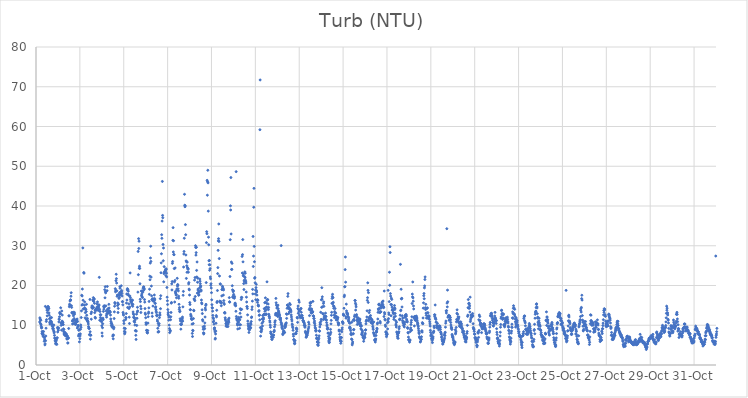
| Category | Turb (NTU) |
|---|---|
| 44470.166666666664 | 10.82 |
| 44470.177083333336 | 11.87 |
| 44470.1875 | 11.6 |
| 44470.197916666664 | 11.34 |
| 44470.208333333336 | 10.41 |
| 44470.21875 | 11.25 |
| 44470.229166666664 | 10.13 |
| 44470.239583333336 | 9.72 |
| 44470.25 | 9.32 |
| 44470.260416666664 | 9.4 |
| 44470.270833333336 | 7.91 |
| 44470.28125 | 8.44 |
| 44470.291666666664 | 8.26 |
| 44470.302083333336 | 7.78 |
| 44470.3125 | 7.31 |
| 44470.322916666664 | 7.8 |
| 44470.333333333336 | 7.64 |
| 44470.34375 | 8.42 |
| 44470.354166666664 | 7.11 |
| 44470.364583333336 | 7.03 |
| 44470.375 | 5.97 |
| 44470.385416666664 | 6.92 |
| 44470.395833333336 | 6.49 |
| 44470.40625 | 5.06 |
| 44470.416666666664 | 5.33 |
| 44470.427083333336 | 14.74 |
| 44470.4375 | 6.1 |
| 44470.447916666664 | 7.29 |
| 44470.458333333336 | 9.26 |
| 44470.46875 | 10.96 |
| 44470.479166666664 | 11.41 |
| 44470.489583333336 | 14.35 |
| 44470.5 | 13.8 |
| 44470.510416666664 | 12.36 |
| 44470.520833333336 | 13.19 |
| 44470.53125 | 14.47 |
| 44470.541666666664 | 14.7 |
| 44470.552083333336 | 13.8 |
| 44470.5625 | 14.67 |
| 44470.572916666664 | 14.28 |
| 44470.583333333336 | 14.2 |
| 44470.59375 | 13.1 |
| 44470.604166666664 | 12.51 |
| 44470.614583333336 | 11.63 |
| 44470.625 | 10.66 |
| 44470.635416666664 | 10.29 |
| 44470.645833333336 | 10.95 |
| 44470.65625 | 11.85 |
| 44470.666666666664 | 11.84 |
| 44470.677083333336 | 11.02 |
| 44470.6875 | 11.02 |
| 44470.697916666664 | 10.88 |
| 44470.708333333336 | 11.93 |
| 44470.71875 | 10.54 |
| 44470.729166666664 | 9.84 |
| 44470.739583333336 | 10.07 |
| 44470.75 | 10 |
| 44470.760416666664 | 9.24 |
| 44470.770833333336 | 9.63 |
| 44470.78125 | 8.99 |
| 44470.791666666664 | 9.18 |
| 44470.802083333336 | 8.58 |
| 44470.8125 | 10.06 |
| 44470.822916666664 | 8.08 |
| 44470.833333333336 | 8.33 |
| 44470.84375 | 7.45 |
| 44470.854166666664 | 6.8 |
| 44470.864583333336 | 6.72 |
| 44470.875 | 6.19 |
| 44470.885416666664 | 5.91 |
| 44470.895833333336 | 5.3 |
| 44470.90625 | 5.5 |
| 44470.916666666664 | 5.4 |
| 44470.927083333336 | 6.09 |
| 44470.9375 | 6.54 |
| 44470.947916666664 | 5.18 |
| 44470.958333333336 | 6.84 |
| 44470.96875 | 6.82 |
| 44470.979166666664 | 9.44 |
| 44470.989583333336 | 8.32 |
| 44471.0 | 9.1 |
| 44471.010416666664 | 9.16 |
| 44471.020833333336 | 8.75 |
| 44471.03125 | 9.36 |
| 44471.041666666664 | 10.84 |
| 44471.052083333336 | 11.56 |
| 44471.0625 | 11.46 |
| 44471.072916666664 | 12.13 |
| 44471.083333333336 | 13.23 |
| 44471.09375 | 12.94 |
| 44471.104166666664 | 12.97 |
| 44471.114583333336 | 12.9 |
| 44471.125 | 14.39 |
| 44471.135416666664 | 10.58 |
| 44471.145833333336 | 9.98 |
| 44471.15625 | 10.6 |
| 44471.166666666664 | 8.78 |
| 44471.177083333336 | 13.58 |
| 44471.1875 | 11.04 |
| 44471.197916666664 | 12.56 |
| 44471.208333333336 | 10.91 |
| 44471.21875 | 10.21 |
| 44471.229166666664 | 10.65 |
| 44471.239583333336 | 10.18 |
| 44471.25 | 9.11 |
| 44471.260416666664 | 8.39 |
| 44471.270833333336 | 8.91 |
| 44471.28125 | 7.78 |
| 44471.291666666664 | 7.94 |
| 44471.302083333336 | 7.55 |
| 44471.3125 | 7.78 |
| 44471.322916666664 | 8.18 |
| 44471.333333333336 | 7.99 |
| 44471.34375 | 7.42 |
| 44471.354166666664 | 7.4 |
| 44471.364583333336 | 7.66 |
| 44471.375 | 7.23 |
| 44471.385416666664 | 7.81 |
| 44471.395833333336 | 7.36 |
| 44471.40625 | 6.56 |
| 44471.416666666664 | 6.58 |
| 44471.427083333336 | 7.37 |
| 44471.4375 | 6.61 |
| 44471.447916666664 | 5.54 |
| 44471.458333333336 | 5.54 |
| 44471.46875 | 6.93 |
| 44471.479166666664 | 6.75 |
| 44471.489583333336 | 9.19 |
| 44471.5 | 12.39 |
| 44471.510416666664 | 12.34 |
| 44471.520833333336 | 14.66 |
| 44471.53125 | 15.29 |
| 44471.541666666664 | 15 |
| 44471.552083333336 | 16.1 |
| 44471.5625 | 16.31 |
| 44471.572916666664 | 16.34 |
| 44471.583333333336 | 16.35 |
| 44471.59375 | 17.3 |
| 44471.604166666664 | 18.18 |
| 44471.614583333336 | 14.93 |
| 44471.625 | 14.49 |
| 44471.635416666664 | 13.22 |
| 44471.645833333336 | 13.04 |
| 44471.65625 | 11.05 |
| 44471.666666666664 | 10.32 |
| 44471.677083333336 | 11.3 |
| 44471.6875 | 12.94 |
| 44471.697916666664 | 13.27 |
| 44471.708333333336 | 12.36 |
| 44471.71875 | 11.2 |
| 44471.729166666664 | 10.47 |
| 44471.739583333336 | 11.68 |
| 44471.75 | 13.23 |
| 44471.760416666664 | 12.82 |
| 44471.770833333336 | 10.49 |
| 44471.78125 | 11.2 |
| 44471.791666666664 | 10.22 |
| 44471.802083333336 | 10.23 |
| 44471.8125 | 10.3 |
| 44471.822916666664 | 10.93 |
| 44471.833333333336 | 11.26 |
| 44471.84375 | 11.37 |
| 44471.854166666664 | 10.8 |
| 44471.864583333336 | 10.98 |
| 44471.875 | 11.56 |
| 44471.885416666664 | 9.3 |
| 44471.895833333336 | 10.96 |
| 44471.90625 | 9.69 |
| 44471.916666666664 | 9.97 |
| 44471.927083333336 | 9.83 |
| 44471.9375 | 7.31 |
| 44471.947916666664 | 8.72 |
| 44471.958333333336 | 7.72 |
| 44471.96875 | 8.88 |
| 44471.979166666664 | 5.82 |
| 44471.989583333336 | 7.68 |
| 44472.0 | 6.63 |
| 44472.010416666664 | 7.32 |
| 44472.020833333336 | 7.83 |
| 44472.03125 | 8.99 |
| 44472.041666666664 | 10.06 |
| 44472.052083333336 | 9.5 |
| 44472.0625 | 11.94 |
| 44472.072916666664 | 13.62 |
| 44472.083333333336 | 17.54 |
| 44472.09375 | 15.07 |
| 44472.104166666664 | 17.37 |
| 44472.114583333336 | 19.11 |
| 44472.125 | 15.24 |
| 44472.135416666664 | 29.45 |
| 44472.145833333336 | 16.3 |
| 44472.15625 | 14.13 |
| 44472.166666666664 | 359.94 |
| 44472.177083333336 | 23.27 |
| 44472.1875 | 23.09 |
| 44472.197916666664 | 14.13 |
| 44472.208333333336 | 15.04 |
| 44472.21875 | 15.88 |
| 44472.229166666664 | 14.35 |
| 44472.239583333336 | 11.88 |
| 44472.25 | 13.17 |
| 44472.260416666664 | 13.97 |
| 44472.270833333336 | 14.01 |
| 44472.28125 | 11.56 |
| 44472.291666666664 | 13.44 |
| 44472.302083333336 | 15.26 |
| 44472.3125 | 12.51 |
| 44472.322916666664 | 11.46 |
| 44472.333333333336 | 11.23 |
| 44472.34375 | 11.72 |
| 44472.354166666664 | 11.02 |
| 44472.364583333336 | 10.98 |
| 44472.375 | 10.78 |
| 44472.385416666664 | 10.32 |
| 44472.395833333336 | 9.66 |
| 44472.40625 | 9.3 |
| 44472.416666666664 | 9.26 |
| 44472.427083333336 | 9.19 |
| 44472.4375 | 7.66 |
| 44472.447916666664 | 7.56 |
| 44472.458333333336 | 16.49 |
| 44472.46875 | 8.36 |
| 44472.479166666664 | 6.5 |
| 44472.489583333336 | 7.54 |
| 44472.5 | 7.48 |
| 44472.510416666664 | 12.92 |
| 44472.520833333336 | 11.52 |
| 44472.53125 | 13.34 |
| 44472.541666666664 | 14.54 |
| 44472.552083333336 | 14.86 |
| 44472.5625 | 14.26 |
| 44472.572916666664 | 14.79 |
| 44472.583333333336 | 14.3 |
| 44472.59375 | 16.38 |
| 44472.604166666664 | 16.19 |
| 44472.614583333336 | 16.95 |
| 44472.625 | 14.47 |
| 44472.635416666664 | 15.98 |
| 44472.645833333336 | 16.54 |
| 44472.65625 | 16.63 |
| 44472.666666666664 | 15.51 |
| 44472.677083333336 | 13.17 |
| 44472.6875 | 13.84 |
| 44472.697916666664 | 12 |
| 44472.708333333336 | 11.79 |
| 44472.71875 | 13.69 |
| 44472.729166666664 | 14 |
| 44472.739583333336 | 13.88 |
| 44472.75 | 13.92 |
| 44472.760416666664 | 14.3 |
| 44472.770833333336 | 14.12 |
| 44472.78125 | 15.36 |
| 44472.791666666664 | 14.64 |
| 44472.802083333336 | 15.87 |
| 44472.8125 | 14.5 |
| 44472.822916666664 | 14.27 |
| 44472.833333333336 | 13.74 |
| 44472.84375 | 14.73 |
| 44472.854166666664 | 14.53 |
| 44472.864583333336 | 15.14 |
| 44472.875 | 15.05 |
| 44472.885416666664 | 22.05 |
| 44472.895833333336 | 14.02 |
| 44472.90625 | 11.25 |
| 44472.916666666664 | 13.46 |
| 44472.927083333336 | 12.64 |
| 44472.9375 | 11.96 |
| 44472.947916666664 | 11.2 |
| 44472.958333333336 | 12.63 |
| 44472.96875 | 11.59 |
| 44472.979166666664 | 11.04 |
| 44472.989583333336 | 10.89 |
| 44473.0 | 9.86 |
| 44473.010416666664 | 8.06 |
| 44473.020833333336 | 7.28 |
| 44473.03125 | 9.38 |
| 44473.041666666664 | 10.39 |
| 44473.052083333336 | 11.78 |
| 44473.0625 | 11.41 |
| 44473.072916666664 | 13.48 |
| 44473.083333333336 | 14.69 |
| 44473.09375 | 14.05 |
| 44473.104166666664 | 14.89 |
| 44473.114583333336 | 14.54 |
| 44473.125 | 14.83 |
| 44473.135416666664 | 18.94 |
| 44473.145833333336 | 16.9 |
| 44473.15625 | 19.7 |
| 44473.166666666664 | 18.41 |
| 44473.177083333336 | 18.15 |
| 44473.1875 | 14.88 |
| 44473.197916666664 | 13.6 |
| 44473.208333333336 | 12.51 |
| 44473.21875 | 12.05 |
| 44473.229166666664 | 12.93 |
| 44473.239583333336 | 18.7 |
| 44473.25 | 19.76 |
| 44473.260416666664 | 14.02 |
| 44473.270833333336 | 12.95 |
| 44473.28125 | 13.22 |
| 44473.291666666664 | 13.56 |
| 44473.302083333336 | 14.21 |
| 44473.3125 | 13.23 |
| 44473.322916666664 | 15.27 |
| 44473.333333333336 | 14.33 |
| 44473.34375 | 13.16 |
| 44473.354166666664 | 13.6 |
| 44473.364583333336 | 13.4 |
| 44473.375 | 13.36 |
| 44473.385416666664 | 13.28 |
| 44473.395833333336 | 12.57 |
| 44473.40625 | 11.58 |
| 44473.416666666664 | 10.96 |
| 44473.427083333336 | 10.47 |
| 44473.4375 | 9.91 |
| 44473.447916666664 | 10.5 |
| 44473.458333333336 | 9.86 |
| 44473.46875 | 10.13 |
| 44473.479166666664 | 9.46 |
| 44473.489583333336 | 9.73 |
| 44473.5 | 7.26 |
| 44473.510416666664 | 7.54 |
| 44473.520833333336 | 6.58 |
| 44473.53125 | 7.52 |
| 44473.541666666664 | 9.12 |
| 44473.552083333336 | 9.48 |
| 44473.5625 | 11.69 |
| 44473.572916666664 | 13.37 |
| 44473.583333333336 | 14.79 |
| 44473.59375 | 15.71 |
| 44473.604166666664 | 15.45 |
| 44473.614583333336 | 19.2 |
| 44473.625 | 18.41 |
| 44473.635416666664 | 18.81 |
| 44473.645833333336 | 21.21 |
| 44473.65625 | 22.83 |
| 44473.666666666664 | 21.73 |
| 44473.677083333336 | 20.62 |
| 44473.6875 | 18.64 |
| 44473.697916666664 | 17.27 |
| 44473.708333333336 | 17.6 |
| 44473.71875 | 14.95 |
| 44473.729166666664 | 15.61 |
| 44473.739583333336 | 13.21 |
| 44473.75 | 14.24 |
| 44473.760416666664 | 15.28 |
| 44473.770833333336 | 17.74 |
| 44473.78125 | 16.75 |
| 44473.791666666664 | 17.51 |
| 44473.802083333336 | 17.03 |
| 44473.8125 | 18.22 |
| 44473.822916666664 | 19.67 |
| 44473.833333333336 | 19.3 |
| 44473.84375 | 18.2 |
| 44473.854166666664 | 17.64 |
| 44473.864583333336 | 17.7 |
| 44473.875 | 18.4 |
| 44473.885416666664 | 19.93 |
| 44473.895833333336 | 18.46 |
| 44473.90625 | 18.73 |
| 44473.916666666664 | 18.01 |
| 44473.927083333336 | 17.36 |
| 44473.9375 | 15.93 |
| 44473.947916666664 | 15.95 |
| 44473.958333333336 | 15.13 |
| 44473.96875 | 13.22 |
| 44473.979166666664 | 12.83 |
| 44473.989583333336 | 12.55 |
| 44474.0 | 11.11 |
| 44474.010416666664 | 10.45 |
| 44474.020833333336 | 9.25 |
| 44474.03125 | 8.46 |
| 44474.041666666664 | 7.85 |
| 44474.052083333336 | 8.07 |
| 44474.0625 | 8.31 |
| 44474.072916666664 | 9.17 |
| 44474.083333333336 | 11.42 |
| 44474.09375 | 11.97 |
| 44474.104166666664 | 11.84 |
| 44474.114583333336 | 12.94 |
| 44474.125 | 15.58 |
| 44474.135416666664 | 17.85 |
| 44474.145833333336 | 16.34 |
| 44474.15625 | 18.89 |
| 44474.166666666664 | 19.21 |
| 44474.177083333336 | 14.47 |
| 44474.1875 | 19 |
| 44474.197916666664 | 17.86 |
| 44474.208333333336 | 18.58 |
| 44474.21875 | 17.53 |
| 44474.229166666664 | 15.37 |
| 44474.239583333336 | 14.2 |
| 44474.25 | 12.03 |
| 44474.260416666664 | 10.44 |
| 44474.270833333336 | 14.59 |
| 44474.28125 | 17.35 |
| 44474.291666666664 | 23.16 |
| 44474.302083333336 | 16.94 |
| 44474.3125 | 16.39 |
| 44474.322916666664 | 15.88 |
| 44474.333333333336 | 16.41 |
| 44474.34375 | 16.05 |
| 44474.354166666664 | 16.23 |
| 44474.364583333336 | 15.57 |
| 44474.375 | 15.13 |
| 44474.385416666664 | 16.17 |
| 44474.395833333336 | 16.34 |
| 44474.40625 | 14.77 |
| 44474.416666666664 | 15.27 |
| 44474.427083333336 | 13.34 |
| 44474.4375 | 12.88 |
| 44474.447916666664 | 12.02 |
| 44474.458333333336 | 12.65 |
| 44474.46875 | 11.02 |
| 44474.479166666664 | 11.81 |
| 44474.489583333336 | 11.88 |
| 44474.5 | 10.76 |
| 44474.510416666664 | 10.05 |
| 44474.520833333336 | 11.33 |
| 44474.53125 | 8.65 |
| 44474.541666666664 | 8.63 |
| 44474.552083333336 | 7.48 |
| 44474.5625 | 6.43 |
| 44474.572916666664 | 8.53 |
| 44474.583333333336 | 12.79 |
| 44474.59375 | 9.95 |
| 44474.604166666664 | 11.76 |
| 44474.614583333336 | 13.33 |
| 44474.625 | 14.51 |
| 44474.635416666664 | 13.61 |
| 44474.645833333336 | 18.34 |
| 44474.65625 | 28.57 |
| 44474.666666666664 | 22.72 |
| 44474.677083333336 | 31.79 |
| 44474.6875 | 29.31 |
| 44474.697916666664 | 31.14 |
| 44474.708333333336 | 24.33 |
| 44474.71875 | 24.86 |
| 44474.729166666664 | 24.29 |
| 44474.739583333336 | 20.44 |
| 44474.75 | 16.53 |
| 44474.760416666664 | 15.95 |
| 44474.770833333336 | 14.79 |
| 44474.78125 | 13.21 |
| 44474.791666666664 | 14.14 |
| 44474.802083333336 | 18.61 |
| 44474.8125 | 17.46 |
| 44474.822916666664 | 17.85 |
| 44474.833333333336 | 17.17 |
| 44474.84375 | 18.54 |
| 44474.854166666664 | 16.96 |
| 44474.864583333336 | 18.3 |
| 44474.875 | 18.6 |
| 44474.885416666664 | 19.3 |
| 44474.895833333336 | 19.45 |
| 44474.90625 | 19.65 |
| 44474.916666666664 | 19.61 |
| 44474.927083333336 | 18.96 |
| 44474.9375 | 19.16 |
| 44474.947916666664 | 16.46 |
| 44474.958333333336 | 15.82 |
| 44474.96875 | 14.19 |
| 44474.979166666664 | 13.05 |
| 44474.989583333336 | 12.73 |
| 44475.0 | 11.88 |
| 44475.010416666664 | 10.61 |
| 44475.020833333336 | 10.2 |
| 44475.03125 | 10.55 |
| 44475.041666666664 | 8.73 |
| 44475.052083333336 | 8.69 |
| 44475.0625 | 8.28 |
| 44475.072916666664 | 8.11 |
| 44475.083333333336 | 8.08 |
| 44475.09375 | 8.66 |
| 44475.104166666664 | 10.55 |
| 44475.114583333336 | 12.15 |
| 44475.125 | 12.98 |
| 44475.135416666664 | 13.32 |
| 44475.145833333336 | 14.37 |
| 44475.15625 | 15.99 |
| 44475.166666666664 | 17.78 |
| 44475.177083333336 | 19.07 |
| 44475.1875 | 22.35 |
| 44475.197916666664 | 21.44 |
| 44475.208333333336 | 25.63 |
| 44475.21875 | 26.92 |
| 44475.229166666664 | 29.88 |
| 44475.239583333336 | 26.05 |
| 44475.25 | 22.12 |
| 44475.260416666664 | 19.86 |
| 44475.270833333336 | 17.41 |
| 44475.28125 | 16.42 |
| 44475.291666666664 | 13.07 |
| 44475.302083333336 | 12.23 |
| 44475.3125 | 16.67 |
| 44475.322916666664 | 16.36 |
| 44475.333333333336 | 14.82 |
| 44475.34375 | 16.06 |
| 44475.354166666664 | 16.63 |
| 44475.364583333336 | 16.36 |
| 44475.375 | 16.09 |
| 44475.385416666664 | 16.54 |
| 44475.395833333336 | 17.61 |
| 44475.40625 | 16.7 |
| 44475.416666666664 | 16.38 |
| 44475.427083333336 | 15.57 |
| 44475.4375 | 15.49 |
| 44475.447916666664 | 14.41 |
| 44475.458333333336 | 14.65 |
| 44475.46875 | 13.91 |
| 44475.479166666664 | 13.52 |
| 44475.489583333336 | 13.18 |
| 44475.5 | 12.48 |
| 44475.510416666664 | 12.34 |
| 44475.520833333336 | 12.56 |
| 44475.53125 | 11.32 |
| 44475.541666666664 | 10.98 |
| 44475.552083333336 | 9.24 |
| 44475.5625 | 8.29 |
| 44475.572916666664 | 10.41 |
| 44475.583333333336 | 8.35 |
| 44475.59375 | 8.42 |
| 44475.604166666664 | 9.94 |
| 44475.614583333336 | 10.41 |
| 44475.625 | 11.91 |
| 44475.635416666664 | 12.52 |
| 44475.645833333336 | 13.12 |
| 44475.65625 | 12.58 |
| 44475.666666666664 | 16.7 |
| 44475.677083333336 | 14.17 |
| 44475.6875 | 17.44 |
| 44475.697916666664 | 23.21 |
| 44475.708333333336 | 25.69 |
| 44475.71875 | 27.98 |
| 44475.729166666664 | 32.77 |
| 44475.739583333336 | 31.87 |
| 44475.75 | 36.21 |
| 44475.760416666664 | 46.18 |
| 44475.770833333336 | 37.63 |
| 44475.78125 | 37.05 |
| 44475.791666666664 | 30.32 |
| 44475.802083333336 | 26.22 |
| 44475.8125 | 29.43 |
| 44475.822916666664 | 20.92 |
| 44475.833333333336 | 22.99 |
| 44475.84375 | 24.74 |
| 44475.854166666664 | 23.26 |
| 44475.864583333336 | 23.53 |
| 44475.875 | 23.37 |
| 44475.885416666664 | 23.55 |
| 44475.895833333336 | 23.9 |
| 44475.90625 | 23.64 |
| 44475.916666666664 | 22.48 |
| 44475.927083333336 | 24.21 |
| 44475.9375 | 24.07 |
| 44475.947916666664 | 23.09 |
| 44475.958333333336 | 22.17 |
| 44475.96875 | 19.5 |
| 44475.979166666664 | 17.06 |
| 44475.989583333336 | 16.16 |
| 44476.0 | 15.22 |
| 44476.010416666664 | 13.94 |
| 44476.020833333336 | 12.79 |
| 44476.03125 | 13.23 |
| 44476.041666666664 | 12.44 |
| 44476.052083333336 | 11.27 |
| 44476.0625 | 12.03 |
| 44476.072916666664 | 10.03 |
| 44476.083333333336 | 9.17 |
| 44476.09375 | 8.14 |
| 44476.104166666664 | 8.78 |
| 44476.114583333336 | 8.71 |
| 44476.125 | 8.54 |
| 44476.135416666664 | 11.39 |
| 44476.145833333336 | 12.14 |
| 44476.15625 | 13.22 |
| 44476.166666666664 | 15.56 |
| 44476.177083333336 | 15.73 |
| 44476.1875 | 20.42 |
| 44476.197916666664 | 18.88 |
| 44476.208333333336 | 20.99 |
| 44476.21875 | 25.56 |
| 44476.229166666664 | 26.03 |
| 44476.239583333336 | 31.36 |
| 44476.25 | 34.55 |
| 44476.260416666664 | 28.44 |
| 44476.270833333336 | 31.26 |
| 44476.28125 | 27.82 |
| 44476.291666666664 | 27.73 |
| 44476.302083333336 | 24.25 |
| 44476.3125 | 20.91 |
| 44476.322916666664 | 15.85 |
| 44476.333333333336 | 21.26 |
| 44476.34375 | 24.42 |
| 44476.354166666664 | 18.47 |
| 44476.364583333336 | 18.16 |
| 44476.375 | 18.06 |
| 44476.385416666664 | 17.61 |
| 44476.395833333336 | 17.7 |
| 44476.40625 | 16.9 |
| 44476.416666666664 | 18.88 |
| 44476.427083333336 | 19.16 |
| 44476.4375 | 21.81 |
| 44476.447916666664 | 19.87 |
| 44476.458333333336 | 20.25 |
| 44476.46875 | 20.09 |
| 44476.479166666664 | 19.16 |
| 44476.489583333336 | 18.64 |
| 44476.5 | 17.32 |
| 44476.510416666664 | 16.79 |
| 44476.520833333336 | 15.27 |
| 44476.53125 | 13.99 |
| 44476.541666666664 | 14.45 |
| 44476.552083333336 | 13.41 |
| 44476.5625 | 13.55 |
| 44476.572916666664 | 11.64 |
| 44476.583333333336 | 11.11 |
| 44476.59375 | 10.29 |
| 44476.604166666664 | 9.02 |
| 44476.614583333336 | 10.16 |
| 44476.625 | 10.18 |
| 44476.635416666664 | 10.29 |
| 44476.645833333336 | 10.92 |
| 44476.65625 | 11.4 |
| 44476.666666666664 | 11.71 |
| 44476.677083333336 | 12.06 |
| 44476.6875 | 11.04 |
| 44476.697916666664 | 14.62 |
| 44476.708333333336 | 17.55 |
| 44476.71875 | 18.51 |
| 44476.729166666664 | 24.65 |
| 44476.739583333336 | 27.92 |
| 44476.75 | 28.56 |
| 44476.760416666664 | 31.89 |
| 44476.770833333336 | 42.94 |
| 44476.78125 | 40.19 |
| 44476.791666666664 | 39.81 |
| 44476.802083333336 | 40.03 |
| 44476.8125 | 35.32 |
| 44476.822916666664 | 32.77 |
| 44476.833333333336 | 27.68 |
| 44476.84375 | 26.19 |
| 44476.854166666664 | 21.78 |
| 44476.864583333336 | 25.96 |
| 44476.875 | 24.96 |
| 44476.885416666664 | 23.32 |
| 44476.895833333336 | 25.88 |
| 44476.90625 | 24.51 |
| 44476.916666666664 | 24.38 |
| 44476.927083333336 | 24.07 |
| 44476.9375 | 24.2 |
| 44476.947916666664 | 23.35 |
| 44476.958333333336 | 20.4 |
| 44476.96875 | 20.73 |
| 44476.979166666664 | 19.1 |
| 44476.989583333336 | 18.9 |
| 44477.0 | 17.61 |
| 44477.010416666664 | 15.71 |
| 44477.020833333336 | 15.22 |
| 44477.03125 | 13.92 |
| 44477.041666666664 | 13.91 |
| 44477.052083333336 | 12.76 |
| 44477.0625 | 12.39 |
| 44477.072916666664 | 12.25 |
| 44477.083333333336 | 11.63 |
| 44477.09375 | 11.71 |
| 44477.104166666664 | 11.41 |
| 44477.114583333336 | 10.29 |
| 44477.125 | 7.95 |
| 44477.135416666664 | 7.16 |
| 44477.145833333336 | 8.72 |
| 44477.15625 | 8.62 |
| 44477.166666666664 | 10.42 |
| 44477.177083333336 | 11.68 |
| 44477.1875 | 13.77 |
| 44477.197916666664 | 13.65 |
| 44477.208333333336 | 16.64 |
| 44477.21875 | 16.52 |
| 44477.229166666664 | 21.35 |
| 44477.239583333336 | 16.19 |
| 44477.25 | 22 |
| 44477.260416666664 | 17.23 |
| 44477.270833333336 | 30.02 |
| 44477.28125 | 29.56 |
| 44477.291666666664 | 27.64 |
| 44477.302083333336 | 28.27 |
| 44477.3125 | 29.62 |
| 44477.322916666664 | 23.8 |
| 44477.333333333336 | 22.15 |
| 44477.34375 | 25.92 |
| 44477.354166666664 | 18.08 |
| 44477.364583333336 | 20.82 |
| 44477.375 | 21.83 |
| 44477.385416666664 | 19.09 |
| 44477.395833333336 | 18.75 |
| 44477.40625 | 18.14 |
| 44477.416666666664 | 17.56 |
| 44477.427083333336 | 17.64 |
| 44477.4375 | 18.45 |
| 44477.447916666664 | 18.42 |
| 44477.458333333336 | 19.4 |
| 44477.46875 | 21.63 |
| 44477.479166666664 | 21.08 |
| 44477.489583333336 | 20.46 |
| 44477.5 | 19.95 |
| 44477.510416666664 | 19.67 |
| 44477.520833333336 | 18.9 |
| 44477.53125 | 18.64 |
| 44477.541666666664 | 16.35 |
| 44477.552083333336 | 15.64 |
| 44477.5625 | 15.39 |
| 44477.572916666664 | 13.88 |
| 44477.583333333336 | 12.94 |
| 44477.59375 | 11.4 |
| 44477.604166666664 | 11.09 |
| 44477.614583333336 | 9.59 |
| 44477.625 | 9 |
| 44477.635416666664 | 8.09 |
| 44477.645833333336 | 7.8 |
| 44477.65625 | 8 |
| 44477.666666666664 | 9.05 |
| 44477.677083333336 | 9.78 |
| 44477.6875 | 9.19 |
| 44477.697916666664 | 10.59 |
| 44477.708333333336 | 12.08 |
| 44477.71875 | 14.32 |
| 44477.729166666664 | 13.86 |
| 44477.739583333336 | 14.97 |
| 44477.75 | 15.27 |
| 44477.760416666664 | 20.73 |
| 44477.770833333336 | 30.78 |
| 44477.78125 | 33.54 |
| 44477.791666666664 | 33.03 |
| 44477.802083333336 | 46.46 |
| 44477.8125 | 42.72 |
| 44477.822916666664 | 46.1 |
| 44477.833333333336 | 48.99 |
| 44477.84375 | 45.82 |
| 44477.854166666664 | 38.71 |
| 44477.864583333336 | 32.16 |
| 44477.875 | 30.24 |
| 44477.885416666664 | 26.22 |
| 44477.895833333336 | 25.23 |
| 44477.90625 | 26.29 |
| 44477.916666666664 | 23.84 |
| 44477.927083333336 | 25.21 |
| 44477.9375 | 24.25 |
| 44477.947916666664 | 22.15 |
| 44477.958333333336 | 21.69 |
| 44477.96875 | 20.03 |
| 44477.979166666664 | 20.45 |
| 44477.989583333336 | 19.36 |
| 44478.0 | 18.2 |
| 44478.010416666664 | 16.4 |
| 44478.020833333336 | 15.18 |
| 44478.03125 | 14.42 |
| 44478.041666666664 | 14.33 |
| 44478.052083333336 | 13.54 |
| 44478.0625 | 12.49 |
| 44478.072916666664 | 11.9 |
| 44478.083333333336 | 10.83 |
| 44478.09375 | 11.62 |
| 44478.104166666664 | 11.05 |
| 44478.114583333336 | 10.28 |
| 44478.125 | 9.28 |
| 44478.135416666664 | 8.89 |
| 44478.145833333336 | 9.33 |
| 44478.15625 | 8.34 |
| 44478.166666666664 | 6.51 |
| 44478.177083333336 | 6.72 |
| 44478.1875 | 7.81 |
| 44478.197916666664 | 8.53 |
| 44478.208333333336 | 10.5 |
| 44478.21875 | 12.44 |
| 44478.229166666664 | 12.11 |
| 44478.239583333336 | 13.77 |
| 44478.25 | 15.72 |
| 44478.260416666664 | 15.99 |
| 44478.270833333336 | 18.74 |
| 44478.28125 | 23 |
| 44478.291666666664 | 24.5 |
| 44478.302083333336 | 28.84 |
| 44478.3125 | 31.23 |
| 44478.322916666664 | 31.78 |
| 44478.333333333336 | 35.48 |
| 44478.34375 | 31.09 |
| 44478.354166666664 | 26.77 |
| 44478.364583333336 | 22.39 |
| 44478.375 | 16.05 |
| 44478.385416666664 | 15.85 |
| 44478.395833333336 | 20.41 |
| 44478.40625 | 20.34 |
| 44478.416666666664 | 15.99 |
| 44478.427083333336 | 15.61 |
| 44478.4375 | 241.86 |
| 44478.447916666664 | 14.9 |
| 44478.458333333336 | 15.7 |
| 44478.46875 | 17.38 |
| 44478.479166666664 | 18.97 |
| 44478.489583333336 | 18.99 |
| 44478.5 | 19.81 |
| 44478.510416666664 | 19.55 |
| 44478.520833333336 | 19.16 |
| 44478.53125 | 19.23 |
| 44478.541666666664 | 17.59 |
| 44478.552083333336 | 18.89 |
| 44478.5625 | 16.2 |
| 44478.572916666664 | 15.51 |
| 44478.583333333336 | 15.25 |
| 44478.59375 | 13.15 |
| 44478.604166666664 | 13.22 |
| 44478.614583333336 | 13.04 |
| 44478.625 | 11.89 |
| 44478.635416666664 | 11.5 |
| 44478.645833333336 | 11.13 |
| 44478.65625 | 10.42 |
| 44478.666666666664 | 9.76 |
| 44478.677083333336 | 10.1 |
| 44478.6875 | 10.51 |
| 44478.697916666664 | 10.71 |
| 44478.708333333336 | 9.7 |
| 44478.71875 | 10.73 |
| 44478.729166666664 | 10.79 |
| 44478.739583333336 | 10.63 |
| 44478.75 | 9.68 |
| 44478.760416666664 | 10.32 |
| 44478.770833333336 | 11.49 |
| 44478.78125 | 11.1 |
| 44478.791666666664 | 10.77 |
| 44478.802083333336 | 11.79 |
| 44478.8125 | 16.95 |
| 44478.822916666664 | 15.91 |
| 44478.833333333336 | 15.81 |
| 44478.84375 | 22.26 |
| 44478.854166666664 | 31.52 |
| 44478.864583333336 | 40.04 |
| 44478.875 | 39 |
| 44478.885416666664 | 47.16 |
| 44478.895833333336 | 32.97 |
| 44478.90625 | 25.91 |
| 44478.916666666664 | 24.03 |
| 44478.927083333336 | 24.06 |
| 44478.9375 | 25.57 |
| 44478.947916666664 | 19.94 |
| 44478.958333333336 | 18.91 |
| 44478.96875 | 17.04 |
| 44478.979166666664 | 17.27 |
| 44478.989583333336 | 18.44 |
| 44479.0 | 18.68 |
| 44479.010416666664 | 17.77 |
| 44479.020833333336 | 16.94 |
| 44479.03125 | 16.99 |
| 44479.041666666664 | 16.79 |
| 44479.052083333336 | 17.25 |
| 44479.0625 | 15.12 |
| 44479.072916666664 | 15.55 |
| 44479.083333333336 | 15.52 |
| 44479.09375 | 15.09 |
| 44479.104166666664 | 14.88 |
| 44479.114583333336 | 13.52 |
| 44479.125 | 48.64 |
| 44479.135416666664 | 12.2 |
| 44479.145833333336 | 11.71 |
| 44479.15625 | 11.54 |
| 44479.166666666664 | 11.26 |
| 44479.177083333336 | 10.34 |
| 44479.1875 | 10.05 |
| 44479.197916666664 | 9.07 |
| 44479.208333333336 | 10.77 |
| 44479.21875 | 10.91 |
| 44479.229166666664 | 10.79 |
| 44479.239583333336 | 11.99 |
| 44479.25 | 11.5 |
| 44479.260416666664 | 11.68 |
| 44479.270833333336 | 10.15 |
| 44479.28125 | 9.23 |
| 44479.291666666664 | 11.36 |
| 44479.302083333336 | 13 |
| 44479.3125 | 14.16 |
| 44479.322916666664 | 10.14 |
| 44479.333333333336 | 13.88 |
| 44479.34375 | 12.07 |
| 44479.354166666664 | 16.48 |
| 44479.364583333336 | 17.02 |
| 44479.375 | 14 |
| 44479.385416666664 | 16.97 |
| 44479.395833333336 | 27.31 |
| 44479.40625 | 23.15 |
| 44479.416666666664 | 27.77 |
| 44479.427083333336 | 31.55 |
| 44479.4375 | 25.95 |
| 44479.447916666664 | 22.43 |
| 44479.458333333336 | 22.91 |
| 44479.46875 | 20.48 |
| 44479.479166666664 | 18.99 |
| 44479.489583333336 | 21.3 |
| 44479.5 | 21.04 |
| 44479.510416666664 | 22.22 |
| 44479.520833333336 | 23.43 |
| 44479.53125 | 21.97 |
| 44479.541666666664 | 23.1 |
| 44479.552083333336 | 21.3 |
| 44479.5625 | 20.94 |
| 44479.572916666664 | 20.61 |
| 44479.583333333336 | 18.36 |
| 44479.59375 | 17.07 |
| 44479.604166666664 | 15.85 |
| 44479.614583333336 | 14.71 |
| 44479.625 | 14.64 |
| 44479.635416666664 | 14.21 |
| 44479.645833333336 | 12.61 |
| 44479.65625 | 11.05 |
| 44479.666666666664 | 10.36 |
| 44479.677083333336 | 9.84 |
| 44479.6875 | 9.27 |
| 44479.697916666664 | 8.97 |
| 44479.708333333336 | 8.19 |
| 44479.71875 | 9.63 |
| 44479.729166666664 | 9.52 |
| 44479.739583333336 | 8.86 |
| 44479.75 | 9.52 |
| 44479.760416666664 | 9.96 |
| 44479.770833333336 | 9.47 |
| 44479.78125 | 10.51 |
| 44479.791666666664 | 9.33 |
| 44479.802083333336 | 10.28 |
| 44479.8125 | 10.94 |
| 44479.822916666664 | 11.92 |
| 44479.833333333336 | 12.09 |
| 44479.84375 | 13.97 |
| 44479.854166666664 | 14.62 |
| 44479.864583333336 | 16.07 |
| 44479.875 | 19.02 |
| 44479.885416666664 | 17.89 |
| 44479.895833333336 | 32.34 |
| 44479.90625 | 24.79 |
| 44479.916666666664 | 27.4 |
| 44479.927083333336 | 39.69 |
| 44479.9375 | 44.44 |
| 44479.947916666664 | 29.84 |
| 44479.958333333336 | 25.98 |
| 44479.96875 | 21.82 |
| 44479.979166666664 | 22.01 |
| 44479.989583333336 | 20.68 |
| 44480.0 | 17.87 |
| 44480.010416666664 | 18.84 |
| 44480.020833333336 | 16.43 |
| 44480.03125 | 19.47 |
| 44480.041666666664 | 20.3 |
| 44480.052083333336 | 18.74 |
| 44480.0625 | 18.37 |
| 44480.072916666664 | 17.59 |
| 44480.083333333336 | 16.3 |
| 44480.09375 | 15.76 |
| 44480.104166666664 | 16.41 |
| 44480.114583333336 | 16.29 |
| 44480.125 | 14.97 |
| 44480.135416666664 | 15.1 |
| 44480.145833333336 | 14.82 |
| 44480.15625 | 13.49 |
| 44480.166666666664 | 13.69 |
| 44480.177083333336 | 12.48 |
| 44480.1875 | 12.59 |
| 44480.197916666664 | 11.36 |
| 44480.208333333336 | 59.19 |
| 44480.21875 | 71.71 |
| 44480.229166666664 | 9.42 |
| 44480.239583333336 | 7.27 |
| 44480.25 | 8.47 |
| 44480.260416666664 | 9.38 |
| 44480.270833333336 | 8.35 |
| 44480.28125 | 9.16 |
| 44480.291666666664 | 8.87 |
| 44480.302083333336 | 10.49 |
| 44480.3125 | 11.58 |
| 44480.322916666664 | 9.8 |
| 44480.333333333336 | 12.45 |
| 44480.34375 | 11.63 |
| 44480.354166666664 | 10.91 |
| 44480.364583333336 | 11.45 |
| 44480.375 | 11.82 |
| 44480.385416666664 | 12.55 |
| 44480.395833333336 | 12.79 |
| 44480.40625 | 14.16 |
| 44480.416666666664 | 12.7 |
| 44480.427083333336 | 15.67 |
| 44480.4375 | 13.51 |
| 44480.447916666664 | 14.34 |
| 44480.458333333336 | 16.89 |
| 44480.46875 | 15.78 |
| 44480.479166666664 | 12.69 |
| 44480.489583333336 | 13.88 |
| 44480.5 | 12.82 |
| 44480.510416666664 | 14.59 |
| 44480.520833333336 | 15.5 |
| 44480.53125 | 20.92 |
| 44480.541666666664 | 16.28 |
| 44480.552083333336 | 16.45 |
| 44480.5625 | 16.45 |
| 44480.572916666664 | 14.33 |
| 44480.583333333336 | 15.34 |
| 44480.59375 | 13.93 |
| 44480.604166666664 | 14.47 |
| 44480.614583333336 | 12.76 |
| 44480.625 | 12.33 |
| 44480.635416666664 | 12.2 |
| 44480.645833333336 | 11.81 |
| 44480.65625 | 11.11 |
| 44480.666666666664 | 10.77 |
| 44480.677083333336 | 10.04 |
| 44480.6875 | 9.5 |
| 44480.697916666664 | 8.34 |
| 44480.708333333336 | 7.96 |
| 44480.71875 | 7.97 |
| 44480.729166666664 | 7.05 |
| 44480.739583333336 | 7.63 |
| 44480.75 | 6.51 |
| 44480.760416666664 | 6.41 |
| 44480.770833333336 | 7.28 |
| 44480.78125 | 7.04 |
| 44480.791666666664 | 7.21 |
| 44480.802083333336 | 6.98 |
| 44480.8125 | 7 |
| 44480.822916666664 | 7.51 |
| 44480.833333333336 | 7.53 |
| 44480.84375 | 8.38 |
| 44480.854166666664 | 8.4 |
| 44480.864583333336 | 8.74 |
| 44480.875 | 9.61 |
| 44480.885416666664 | 10.78 |
| 44480.895833333336 | 10.17 |
| 44480.90625 | 11.12 |
| 44480.916666666664 | 12.59 |
| 44480.927083333336 | 12.98 |
| 44480.9375 | 16.75 |
| 44480.947916666664 | 15.66 |
| 44480.958333333336 | 15.08 |
| 44480.96875 | 12.54 |
| 44480.979166666664 | 14.32 |
| 44480.989583333336 | 13.02 |
| 44481.0 | 14.62 |
| 44481.010416666664 | 12.8 |
| 44481.020833333336 | 12.21 |
| 44481.03125 | 15.06 |
| 44481.041666666664 | 14.14 |
| 44481.052083333336 | 13.63 |
| 44481.0625 | 13.4 |
| 44481.072916666664 | 12.48 |
| 44481.083333333336 | 13.07 |
| 44481.09375 | 12.72 |
| 44481.104166666664 | 12.51 |
| 44481.114583333336 | 11.53 |
| 44481.125 | 11.87 |
| 44481.135416666664 | 11.88 |
| 44481.145833333336 | 11.71 |
| 44481.15625 | 11.31 |
| 44481.166666666664 | 10.79 |
| 44481.177083333336 | 30.04 |
| 44481.1875 | 10.16 |
| 44481.197916666664 | 10.49 |
| 44481.208333333336 | 9.35 |
| 44481.21875 | 9.75 |
| 44481.229166666664 | 9.72 |
| 44481.239583333336 | 9.08 |
| 44481.25 | 7.64 |
| 44481.260416666664 | 7.94 |
| 44481.270833333336 | 7.87 |
| 44481.28125 | 8.38 |
| 44481.291666666664 | 8.61 |
| 44481.302083333336 | 8.13 |
| 44481.3125 | 8.3 |
| 44481.322916666664 | 8.17 |
| 44481.333333333336 | 8.18 |
| 44481.34375 | 9.37 |
| 44481.354166666664 | 9.89 |
| 44481.364583333336 | 10.2 |
| 44481.375 | 9.62 |
| 44481.385416666664 | 10.1 |
| 44481.395833333336 | 10.46 |
| 44481.40625 | 10.61 |
| 44481.416666666664 | 12.87 |
| 44481.427083333336 | 11.73 |
| 44481.4375 | 12.75 |
| 44481.447916666664 | 14.26 |
| 44481.458333333336 | 15.07 |
| 44481.46875 | 15.06 |
| 44481.479166666664 | 17.27 |
| 44481.489583333336 | 17.96 |
| 44481.5 | 14.79 |
| 44481.510416666664 | 14.49 |
| 44481.520833333336 | 12.96 |
| 44481.53125 | 14.39 |
| 44481.541666666664 | 14.12 |
| 44481.552083333336 | 13.38 |
| 44481.5625 | 15.48 |
| 44481.572916666664 | 13.97 |
| 44481.583333333336 | 14.17 |
| 44481.59375 | 15.18 |
| 44481.604166666664 | 13.77 |
| 44481.614583333336 | 13.78 |
| 44481.625 | 13.36 |
| 44481.635416666664 | 12.59 |
| 44481.645833333336 | 12.08 |
| 44481.65625 | 11.51 |
| 44481.666666666664 | 11.08 |
| 44481.677083333336 | 10.31 |
| 44481.6875 | 10.11 |
| 44481.697916666664 | 9.61 |
| 44481.708333333336 | 9.36 |
| 44481.71875 | 8.72 |
| 44481.729166666664 | 7.76 |
| 44481.739583333336 | 7.25 |
| 44481.75 | 6.37 |
| 44481.760416666664 | 6.4 |
| 44481.770833333336 | 6.08 |
| 44481.78125 | 5.45 |
| 44481.791666666664 | 5.34 |
| 44481.802083333336 | 5.51 |
| 44481.8125 | 6.11 |
| 44481.822916666664 | 7.88 |
| 44481.833333333336 | 7.94 |
| 44481.84375 | 7.9 |
| 44481.854166666664 | 7.87 |
| 44481.864583333336 | 9.11 |
| 44481.875 | 9.29 |
| 44481.885416666664 | 8.48 |
| 44481.895833333336 | 9.04 |
| 44481.90625 | 11.97 |
| 44481.916666666664 | 11.8 |
| 44481.927083333336 | 10.73 |
| 44481.9375 | 14.2 |
| 44481.947916666664 | 14.84 |
| 44481.958333333336 | 13.01 |
| 44481.96875 | 13.97 |
| 44481.979166666664 | 16.31 |
| 44481.989583333336 | 13.52 |
| 44482.0 | 15.82 |
| 44482.010416666664 | 12.52 |
| 44482.020833333336 | 13.62 |
| 44482.03125 | 12.31 |
| 44482.041666666664 | 12.2 |
| 44482.052083333336 | 11.89 |
| 44482.0625 | 12.22 |
| 44482.072916666664 | 14.11 |
| 44482.083333333336 | 14.24 |
| 44482.09375 | 13.26 |
| 44482.104166666664 | 12.26 |
| 44482.114583333336 | 12.49 |
| 44482.125 | 11.97 |
| 44482.135416666664 | 12.43 |
| 44482.145833333336 | 11.78 |
| 44482.15625 | 11.85 |
| 44482.166666666664 | 11.18 |
| 44482.177083333336 | 11.21 |
| 44482.1875 | 11.03 |
| 44482.197916666664 | 10.95 |
| 44482.208333333336 | 10.76 |
| 44482.21875 | 10.64 |
| 44482.229166666664 | 9.96 |
| 44482.239583333336 | 10.32 |
| 44482.25 | 9.88 |
| 44482.260416666664 | 9.48 |
| 44482.270833333336 | 9.82 |
| 44482.28125 | 8.46 |
| 44482.291666666664 | 8.14 |
| 44482.302083333336 | 8.06 |
| 44482.3125 | 7 |
| 44482.322916666664 | 7.03 |
| 44482.333333333336 | 7.7 |
| 44482.34375 | 7.34 |
| 44482.354166666664 | 7.46 |
| 44482.364583333336 | 7.58 |
| 44482.375 | 7.95 |
| 44482.385416666664 | 8.31 |
| 44482.395833333336 | 8.34 |
| 44482.40625 | 8.79 |
| 44482.416666666664 | 9.16 |
| 44482.427083333336 | 10.76 |
| 44482.4375 | 9.57 |
| 44482.447916666664 | 10.27 |
| 44482.458333333336 | 13.96 |
| 44482.46875 | 12.42 |
| 44482.479166666664 | 14.29 |
| 44482.489583333336 | 15.61 |
| 44482.5 | 14.93 |
| 44482.510416666664 | 13.74 |
| 44482.520833333336 | 15.55 |
| 44482.53125 | 15.8 |
| 44482.541666666664 | 13.21 |
| 44482.552083333336 | 13.04 |
| 44482.5625 | 14.11 |
| 44482.572916666664 | 13.75 |
| 44482.583333333336 | 13.29 |
| 44482.59375 | 13.28 |
| 44482.604166666664 | 13.23 |
| 44482.614583333336 | 13.39 |
| 44482.625 | 16 |
| 44482.635416666664 | 12.37 |
| 44482.645833333336 | 12.29 |
| 44482.65625 | 12.28 |
| 44482.666666666664 | 11.67 |
| 44482.677083333336 | 11.7 |
| 44482.6875 | 10.68 |
| 44482.697916666664 | 11.06 |
| 44482.708333333336 | 10.38 |
| 44482.71875 | 9.86 |
| 44482.729166666664 | 9.38 |
| 44482.739583333336 | 9.21 |
| 44482.75 | 8.68 |
| 44482.760416666664 | 8.5 |
| 44482.770833333336 | 8.72 |
| 44482.78125 | 7.48 |
| 44482.791666666664 | 6.63 |
| 44482.802083333336 | 6.81 |
| 44482.8125 | 6.79 |
| 44482.822916666664 | 5.78 |
| 44482.833333333336 | 5.87 |
| 44482.84375 | 5.17 |
| 44482.854166666664 | 5.03 |
| 44482.864583333336 | 4.93 |
| 44482.875 | 6.36 |
| 44482.885416666664 | 5.65 |
| 44482.895833333336 | 6.74 |
| 44482.90625 | 7.34 |
| 44482.916666666664 | 8.62 |
| 44482.927083333336 | 8.48 |
| 44482.9375 | 9.57 |
| 44482.947916666664 | 10.61 |
| 44482.958333333336 | 10.18 |
| 44482.96875 | 10.27 |
| 44482.979166666664 | 13.27 |
| 44482.989583333336 | 10.97 |
| 44483.0 | 11.48 |
| 44483.010416666664 | 16.4 |
| 44483.020833333336 | 14.51 |
| 44483.03125 | 19.44 |
| 44483.041666666664 | 16.56 |
| 44483.052083333336 | 17.15 |
| 44483.0625 | 14.65 |
| 44483.072916666664 | 12.92 |
| 44483.083333333336 | 12.89 |
| 44483.09375 | 11.43 |
| 44483.104166666664 | 15.49 |
| 44483.114583333336 | 15.89 |
| 44483.125 | 14.75 |
| 44483.135416666664 | 11.85 |
| 44483.145833333336 | 12.18 |
| 44483.15625 | 12.4 |
| 44483.166666666664 | 11.63 |
| 44483.177083333336 | 12.13 |
| 44483.1875 | 11.53 |
| 44483.197916666664 | 13.05 |
| 44483.208333333336 | 12.28 |
| 44483.21875 | 12.17 |
| 44483.229166666664 | 11.29 |
| 44483.239583333336 | 11.34 |
| 44483.25 | 10.66 |
| 44483.260416666664 | 9.83 |
| 44483.270833333336 | 10.09 |
| 44483.28125 | 9.16 |
| 44483.291666666664 | 9.01 |
| 44483.302083333336 | 9.36 |
| 44483.3125 | 8.05 |
| 44483.322916666664 | 7.98 |
| 44483.333333333336 | 7.19 |
| 44483.34375 | 6.04 |
| 44483.354166666664 | 6.63 |
| 44483.364583333336 | 5.61 |
| 44483.375 | 5.76 |
| 44483.385416666664 | 6.35 |
| 44483.395833333336 | 6.78 |
| 44483.40625 | 7.61 |
| 44483.416666666664 | 7.87 |
| 44483.427083333336 | 8.96 |
| 44483.4375 | 8.22 |
| 44483.447916666664 | 10.35 |
| 44483.458333333336 | 11.23 |
| 44483.46875 | 12.5 |
| 44483.479166666664 | 13.25 |
| 44483.489583333336 | 15.52 |
| 44483.5 | 16.75 |
| 44483.510416666664 | 17.25 |
| 44483.520833333336 | 17.79 |
| 44483.53125 | 15.4 |
| 44483.541666666664 | 16.94 |
| 44483.552083333336 | 15.78 |
| 44483.5625 | 14.83 |
| 44483.572916666664 | 14.27 |
| 44483.583333333336 | 14.76 |
| 44483.59375 | 12.56 |
| 44483.604166666664 | 11.94 |
| 44483.614583333336 | 13.45 |
| 44483.625 | 13.12 |
| 44483.635416666664 | 14.21 |
| 44483.645833333336 | 12.35 |
| 44483.65625 | 12.2 |
| 44483.666666666664 | 13.06 |
| 44483.677083333336 | 12.15 |
| 44483.6875 | 11.34 |
| 44483.697916666664 | 11.82 |
| 44483.708333333336 | 12.16 |
| 44483.71875 | 11.37 |
| 44483.729166666664 | 11.67 |
| 44483.739583333336 | 11.36 |
| 44483.75 | 11.97 |
| 44483.760416666664 | 11.87 |
| 44483.770833333336 | 10.67 |
| 44483.78125 | 10.34 |
| 44483.791666666664 | 10.08 |
| 44483.802083333336 | 10.51 |
| 44483.8125 | 8.79 |
| 44483.822916666664 | 8.51 |
| 44483.833333333336 | 8.7 |
| 44483.84375 | 7.71 |
| 44483.854166666664 | 6.99 |
| 44483.864583333336 | 6.5 |
| 44483.875 | 6.02 |
| 44483.885416666664 | 6.12 |
| 44483.895833333336 | 5.46 |
| 44483.90625 | 6.92 |
| 44483.916666666664 | 5.95 |
| 44483.927083333336 | 6.9 |
| 44483.9375 | 8.35 |
| 44483.947916666664 | 8.91 |
| 44483.958333333336 | 9.34 |
| 44483.96875 | 10.86 |
| 44483.979166666664 | 10.82 |
| 44483.989583333336 | 10.43 |
| 44484.0 | 10.63 |
| 44484.010416666664 | 12.8 |
| 44484.020833333336 | 12.52 |
| 44484.03125 | 12.58 |
| 44484.041666666664 | 14.27 |
| 44484.052083333336 | 17.18 |
| 44484.0625 | 17.56 |
| 44484.072916666664 | 19.68 |
| 44484.083333333336 | 19.7 |
| 44484.09375 | 24 |
| 44484.104166666664 | 27.17 |
| 44484.114583333336 | 20.84 |
| 44484.125 | 12.17 |
| 44484.135416666664 | 11.77 |
| 44484.145833333336 | 15.31 |
| 44484.15625 | 13.61 |
| 44484.166666666664 | 13.12 |
| 44484.177083333336 | 13.07 |
| 44484.1875 | 12.79 |
| 44484.197916666664 | 13.01 |
| 44484.208333333336 | 12.79 |
| 44484.21875 | 12.22 |
| 44484.229166666664 | 12.14 |
| 44484.239583333336 | 11.1 |
| 44484.25 | 11.46 |
| 44484.260416666664 | 11.85 |
| 44484.270833333336 | 10.95 |
| 44484.28125 | 10.62 |
| 44484.291666666664 | 9.29 |
| 44484.302083333336 | 9.55 |
| 44484.3125 | 10.5 |
| 44484.322916666664 | 9.45 |
| 44484.333333333336 | 9.08 |
| 44484.34375 | 8.66 |
| 44484.354166666664 | 7.76 |
| 44484.364583333336 | 7.98 |
| 44484.375 | 7.63 |
| 44484.385416666664 | 6.54 |
| 44484.395833333336 | 10.75 |
| 44484.40625 | 6.38 |
| 44484.416666666664 | 5.07 |
| 44484.427083333336 | 5.46 |
| 44484.4375 | 5.8 |
| 44484.447916666664 | 7.78 |
| 44484.458333333336 | 11.25 |
| 44484.46875 | 7.9 |
| 44484.479166666664 | 8.88 |
| 44484.489583333336 | 8.93 |
| 44484.5 | 11.54 |
| 44484.510416666664 | 11.21 |
| 44484.520833333336 | 12.19 |
| 44484.53125 | 12.55 |
| 44484.541666666664 | 16.24 |
| 44484.552083333336 | 16.21 |
| 44484.5625 | 15.55 |
| 44484.572916666664 | 13.82 |
| 44484.583333333336 | 15.13 |
| 44484.59375 | 14.63 |
| 44484.604166666664 | 12.41 |
| 44484.614583333336 | 12.68 |
| 44484.625 | 12 |
| 44484.635416666664 | 11.2 |
| 44484.645833333336 | 10.21 |
| 44484.65625 | 11.35 |
| 44484.666666666664 | 10.82 |
| 44484.677083333336 | 11.62 |
| 44484.6875 | 11.86 |
| 44484.697916666664 | 11.33 |
| 44484.708333333336 | 11.63 |
| 44484.71875 | 10.96 |
| 44484.729166666664 | 10.34 |
| 44484.739583333336 | 11.14 |
| 44484.75 | 11.25 |
| 44484.760416666664 | 10.35 |
| 44484.770833333336 | 11.55 |
| 44484.78125 | 9.89 |
| 44484.791666666664 | 10.6 |
| 44484.802083333336 | 9.75 |
| 44484.8125 | 9.09 |
| 44484.822916666664 | 10.01 |
| 44484.833333333336 | 9.77 |
| 44484.84375 | 7.68 |
| 44484.854166666664 | 8.81 |
| 44484.864583333336 | 7.97 |
| 44484.875 | 8.16 |
| 44484.885416666664 | 8.54 |
| 44484.895833333336 | 7.41 |
| 44484.90625 | 7.05 |
| 44484.916666666664 | 6.94 |
| 44484.927083333336 | 6.83 |
| 44484.9375 | 5.97 |
| 44484.947916666664 | 6.59 |
| 44484.958333333336 | 7.12 |
| 44484.96875 | 6.9 |
| 44484.979166666664 | 6.94 |
| 44484.989583333336 | 6.95 |
| 44485.0 | 7.63 |
| 44485.010416666664 | 7.97 |
| 44485.020833333336 | 8.77 |
| 44485.03125 | 8.85 |
| 44485.041666666664 | 10.35 |
| 44485.052083333336 | 10.96 |
| 44485.0625 | 11.21 |
| 44485.072916666664 | 11.3 |
| 44485.083333333336 | 12.08 |
| 44485.09375 | 13.63 |
| 44485.104166666664 | 16.26 |
| 44485.114583333336 | 16.94 |
| 44485.125 | 20.67 |
| 44485.135416666664 | 18.77 |
| 44485.145833333336 | 15.74 |
| 44485.15625 | 18.2 |
| 44485.166666666664 | 11.13 |
| 44485.177083333336 | 11.7 |
| 44485.1875 | 13.19 |
| 44485.197916666664 | 12.03 |
| 44485.208333333336 | 13.73 |
| 44485.21875 | 11.5 |
| 44485.229166666664 | 12.02 |
| 44485.239583333336 | 11.89 |
| 44485.25 | 12.44 |
| 44485.260416666664 | 11.74 |
| 44485.270833333336 | 10.75 |
| 44485.28125 | 10.63 |
| 44485.291666666664 | 11.47 |
| 44485.302083333336 | 11.36 |
| 44485.3125 | 11.43 |
| 44485.322916666664 | 11.03 |
| 44485.333333333336 | 10.47 |
| 44485.34375 | 10.36 |
| 44485.354166666664 | 9.73 |
| 44485.364583333336 | 9.32 |
| 44485.375 | 8.95 |
| 44485.385416666664 | 8.15 |
| 44485.395833333336 | 10.83 |
| 44485.40625 | 7.88 |
| 44485.416666666664 | 7.75 |
| 44485.427083333336 | 7.34 |
| 44485.4375 | 6.37 |
| 44485.447916666664 | 6.15 |
| 44485.458333333336 | 6.07 |
| 44485.46875 | 5.78 |
| 44485.479166666664 | 6.34 |
| 44485.489583333336 | 6.56 |
| 44485.5 | 7.43 |
| 44485.510416666664 | 8.21 |
| 44485.520833333336 | 8.58 |
| 44485.53125 | 8.33 |
| 44485.541666666664 | 9.25 |
| 44485.552083333336 | 9.06 |
| 44485.5625 | 10.37 |
| 44485.572916666664 | 10.6 |
| 44485.583333333336 | 11.57 |
| 44485.59375 | 13.24 |
| 44485.604166666664 | 14.11 |
| 44485.614583333336 | 13.88 |
| 44485.625 | 15.27 |
| 44485.635416666664 | 15.1 |
| 44485.645833333336 | 14.2 |
| 44485.65625 | 15.28 |
| 44485.666666666664 | 14.19 |
| 44485.677083333336 | 13.17 |
| 44485.6875 | 10.94 |
| 44485.697916666664 | 10.58 |
| 44485.708333333336 | 13.37 |
| 44485.71875 | 13.4 |
| 44485.729166666664 | 14.71 |
| 44485.739583333336 | 14.36 |
| 44485.75 | 14.95 |
| 44485.760416666664 | 14.89 |
| 44485.770833333336 | 15.63 |
| 44485.78125 | 15.04 |
| 44485.791666666664 | 15.91 |
| 44485.802083333336 | 14.67 |
| 44485.8125 | 15.24 |
| 44485.822916666664 | 16.09 |
| 44485.833333333336 | 14.77 |
| 44485.84375 | 14.43 |
| 44485.854166666664 | 14.53 |
| 44485.864583333336 | 12.19 |
| 44485.875 | 18.61 |
| 44485.885416666664 | 13.19 |
| 44485.895833333336 | 12.83 |
| 44485.90625 | 11.51 |
| 44485.916666666664 | 11.3 |
| 44485.927083333336 | 10.06 |
| 44485.9375 | 9.7 |
| 44485.947916666664 | 8.25 |
| 44485.958333333336 | 8.39 |
| 44485.96875 | 7.71 |
| 44485.979166666664 | 7.12 |
| 44485.989583333336 | 7.57 |
| 44486.0 | 7.98 |
| 44486.010416666664 | 7.7 |
| 44486.020833333336 | 10.61 |
| 44486.03125 | 9.07 |
| 44486.041666666664 | 11.36 |
| 44486.052083333336 | 18.78 |
| 44486.0625 | 10.85 |
| 44486.072916666664 | 11.68 |
| 44486.083333333336 | 13.11 |
| 44486.09375 | 12.71 |
| 44486.104166666664 | 15.94 |
| 44486.114583333336 | 23.33 |
| 44486.125 | 20.06 |
| 44486.135416666664 | 29.76 |
| 44486.145833333336 | 28.29 |
| 44486.15625 | 17.97 |
| 44486.166666666664 | 17.34 |
| 44486.177083333336 | 15.23 |
| 44486.1875 | 12.38 |
| 44486.197916666664 | 16.82 |
| 44486.208333333336 | 15.19 |
| 44486.21875 | 16.5 |
| 44486.229166666664 | 14.58 |
| 44486.239583333336 | 13.78 |
| 44486.25 | 13.99 |
| 44486.260416666664 | 13.8 |
| 44486.270833333336 | 13.85 |
| 44486.28125 | 13.1 |
| 44486.291666666664 | 13.18 |
| 44486.302083333336 | 12.86 |
| 44486.3125 | 11.5 |
| 44486.322916666664 | 12.03 |
| 44486.333333333336 | 14.29 |
| 44486.34375 | 14.96 |
| 44486.354166666664 | 13.94 |
| 44486.364583333336 | 14.26 |
| 44486.375 | 12.98 |
| 44486.385416666664 | 12.29 |
| 44486.395833333336 | 11.15 |
| 44486.40625 | 10.27 |
| 44486.416666666664 | 9.97 |
| 44486.427083333336 | 9.55 |
| 44486.4375 | 10.77 |
| 44486.447916666664 | 8.32 |
| 44486.458333333336 | 8.13 |
| 44486.46875 | 7.78 |
| 44486.479166666664 | 7.16 |
| 44486.489583333336 | 6.79 |
| 44486.5 | 7.5 |
| 44486.510416666664 | 6.72 |
| 44486.520833333336 | 8.02 |
| 44486.53125 | 8.12 |
| 44486.541666666664 | 8.38 |
| 44486.552083333336 | 9.13 |
| 44486.5625 | 9.61 |
| 44486.572916666664 | 11.4 |
| 44486.583333333336 | 11.52 |
| 44486.59375 | 11.56 |
| 44486.604166666664 | 12.51 |
| 44486.614583333336 | 25.32 |
| 44486.625 | 13.66 |
| 44486.635416666664 | 13.82 |
| 44486.645833333336 | 19.06 |
| 44486.65625 | 16.67 |
| 44486.666666666664 | 16.66 |
| 44486.677083333336 | 16.78 |
| 44486.6875 | 14.6 |
| 44486.697916666664 | 12.38 |
| 44486.708333333336 | 11.17 |
| 44486.71875 | 11.82 |
| 44486.729166666664 | 10.61 |
| 44486.739583333336 | 10.95 |
| 44486.75 | 10.6 |
| 44486.760416666664 | 10.03 |
| 44486.770833333336 | 9.8 |
| 44486.78125 | 10.29 |
| 44486.791666666664 | 9.57 |
| 44486.802083333336 | 10.26 |
| 44486.8125 | 10.78 |
| 44486.822916666664 | 11.97 |
| 44486.833333333336 | 12.2 |
| 44486.84375 | 12.59 |
| 44486.854166666664 | 12.52 |
| 44486.864583333336 | 12.42 |
| 44486.875 | 12.7 |
| 44486.885416666664 | 12.27 |
| 44486.895833333336 | 11.51 |
| 44486.90625 | 11.22 |
| 44486.916666666664 | 10.87 |
| 44486.927083333336 | 10.84 |
| 44486.9375 | 9.41 |
| 44486.947916666664 | 9.21 |
| 44486.958333333336 | 8.17 |
| 44486.96875 | 8.05 |
| 44486.979166666664 | 7.02 |
| 44486.989583333336 | 6.35 |
| 44487.0 | 6.25 |
| 44487.010416666664 | 6.35 |
| 44487.020833333336 | 6.09 |
| 44487.03125 | 5.75 |
| 44487.041666666664 | 6.2 |
| 44487.052083333336 | 6.31 |
| 44487.0625 | 8.41 |
| 44487.072916666664 | 8.96 |
| 44487.083333333336 | 9.34 |
| 44487.09375 | 10.19 |
| 44487.104166666664 | 10.73 |
| 44487.114583333336 | 11.25 |
| 44487.125 | 8.76 |
| 44487.135416666664 | 12.14 |
| 44487.145833333336 | 15.47 |
| 44487.15625 | 17.84 |
| 44487.166666666664 | 17.13 |
| 44487.177083333336 | 20.89 |
| 44487.1875 | 16.89 |
| 44487.197916666664 | 16.05 |
| 44487.208333333336 | 14.86 |
| 44487.21875 | 14.1 |
| 44487.229166666664 | 11.82 |
| 44487.239583333336 | 12.12 |
| 44487.25 | 9.82 |
| 44487.260416666664 | 11.93 |
| 44487.270833333336 | 12.19 |
| 44487.28125 | 11.33 |
| 44487.291666666664 | 11.45 |
| 44487.302083333336 | 11.23 |
| 44487.3125 | 11.3 |
| 44487.322916666664 | 12.27 |
| 44487.333333333336 | 11.87 |
| 44487.34375 | 12.29 |
| 44487.354166666664 | 11.68 |
| 44487.364583333336 | 11.84 |
| 44487.375 | 11.25 |
| 44487.385416666664 | 10.79 |
| 44487.395833333336 | 10.27 |
| 44487.40625 | 10.5 |
| 44487.416666666664 | 9.93 |
| 44487.427083333336 | 9.62 |
| 44487.4375 | 9.13 |
| 44487.447916666664 | 8.59 |
| 44487.458333333336 | 8.12 |
| 44487.46875 | 7.9 |
| 44487.479166666664 | 7.13 |
| 44487.489583333336 | 6.87 |
| 44487.5 | 6.8 |
| 44487.510416666664 | 6.91 |
| 44487.520833333336 | 5.78 |
| 44487.53125 | 5.95 |
| 44487.541666666664 | 6.65 |
| 44487.552083333336 | 6.43 |
| 44487.5625 | 6.41 |
| 44487.572916666664 | 7.1 |
| 44487.583333333336 | 8.43 |
| 44487.59375 | 8.63 |
| 44487.604166666664 | 8.28 |
| 44487.614583333336 | 10.67 |
| 44487.625 | 10.42 |
| 44487.635416666664 | 10.4 |
| 44487.645833333336 | 11.83 |
| 44487.65625 | 14.3 |
| 44487.666666666664 | 15.63 |
| 44487.677083333336 | 17.43 |
| 44487.6875 | 17.98 |
| 44487.697916666664 | 16.67 |
| 44487.708333333336 | 19.4 |
| 44487.71875 | 19.9 |
| 44487.729166666664 | 21.51 |
| 44487.739583333336 | 22.16 |
| 44487.75 | 14.42 |
| 44487.760416666664 | 13.95 |
| 44487.770833333336 | 15.27 |
| 44487.78125 | 13.04 |
| 44487.791666666664 | 12.49 |
| 44487.802083333336 | 11.8 |
| 44487.8125 | 14.19 |
| 44487.822916666664 | 14.33 |
| 44487.833333333336 | 13.16 |
| 44487.84375 | 14.36 |
| 44487.854166666664 | 11.81 |
| 44487.864583333336 | 12.3 |
| 44487.875 | 13.14 |
| 44487.885416666664 | 11.8 |
| 44487.895833333336 | 12.37 |
| 44487.90625 | 11.68 |
| 44487.916666666664 | 12.06 |
| 44487.927083333336 | 12.3 |
| 44487.9375 | 11.44 |
| 44487.947916666664 | 10.86 |
| 44487.958333333336 | 10.35 |
| 44487.96875 | 9.79 |
| 44487.979166666664 | 8.73 |
| 44487.989583333336 | 8.21 |
| 44488.0 | 7.3 |
| 44488.010416666664 | 7.5 |
| 44488.020833333336 | 7.71 |
| 44488.03125 | 6.59 |
| 44488.041666666664 | 7.33 |
| 44488.052083333336 | 6.7 |
| 44488.0625 | 6.15 |
| 44488.072916666664 | 5.63 |
| 44488.083333333336 | 6.82 |
| 44488.09375 | 6.59 |
| 44488.104166666664 | 7.07 |
| 44488.114583333336 | 8.1 |
| 44488.125 | 8.34 |
| 44488.135416666664 | 8.52 |
| 44488.145833333336 | 9.77 |
| 44488.15625 | 9.39 |
| 44488.166666666664 | 12.64 |
| 44488.177083333336 | 12.16 |
| 44488.1875 | 12.6 |
| 44488.197916666664 | 15.1 |
| 44488.208333333336 | 11.67 |
| 44488.21875 | 11.78 |
| 44488.229166666664 | 11.49 |
| 44488.239583333336 | 10.79 |
| 44488.25 | 10.77 |
| 44488.260416666664 | 9.97 |
| 44488.270833333336 | 9.37 |
| 44488.28125 | 9.67 |
| 44488.291666666664 | 9.57 |
| 44488.302083333336 | 10.47 |
| 44488.3125 | 9.54 |
| 44488.322916666664 | 9.47 |
| 44488.333333333336 | 9.62 |
| 44488.34375 | 9.77 |
| 44488.354166666664 | 8.84 |
| 44488.364583333336 | 9.35 |
| 44488.375 | 9.64 |
| 44488.385416666664 | 9.67 |
| 44488.395833333336 | 9.77 |
| 44488.40625 | 9.82 |
| 44488.416666666664 | 9.39 |
| 44488.427083333336 | 9.53 |
| 44488.4375 | 8.95 |
| 44488.447916666664 | 8.27 |
| 44488.458333333336 | 8.22 |
| 44488.46875 | 7.81 |
| 44488.479166666664 | 7.77 |
| 44488.489583333336 | 6.93 |
| 44488.5 | 7.2 |
| 44488.510416666664 | 6.44 |
| 44488.520833333336 | 6.08 |
| 44488.53125 | 5.91 |
| 44488.541666666664 | 5.26 |
| 44488.552083333336 | 5.31 |
| 44488.5625 | 5.8 |
| 44488.572916666664 | 5.85 |
| 44488.583333333336 | 5.82 |
| 44488.59375 | 6.3 |
| 44488.604166666664 | 6.32 |
| 44488.614583333336 | 7.55 |
| 44488.625 | 6.77 |
| 44488.635416666664 | 8 |
| 44488.645833333336 | 7.41 |
| 44488.65625 | 8.23 |
| 44488.666666666664 | 9.52 |
| 44488.677083333336 | 10.53 |
| 44488.6875 | 11.05 |
| 44488.697916666664 | 13.62 |
| 44488.708333333336 | 13.09 |
| 44488.71875 | 13.69 |
| 44488.729166666664 | 34.29 |
| 44488.739583333336 | 15.57 |
| 44488.75 | 14.62 |
| 44488.760416666664 | 18.84 |
| 44488.770833333336 | 15.91 |
| 44488.78125 | 12 |
| 44488.791666666664 | 12.11 |
| 44488.802083333336 | 12.34 |
| 44488.8125 | 12.48 |
| 44488.822916666664 | 12.33 |
| 44488.833333333336 | 11.23 |
| 44488.84375 | 11.35 |
| 44488.854166666664 | 12.3 |
| 44488.864583333336 | 12.3 |
| 44488.875 | 11.96 |
| 44488.885416666664 | 11.9 |
| 44488.895833333336 | 11.36 |
| 44488.90625 | 10.7 |
| 44488.916666666664 | 10.06 |
| 44488.927083333336 | 9.57 |
| 44488.9375 | 9.18 |
| 44488.947916666664 | 9.37 |
| 44488.958333333336 | 8.93 |
| 44488.96875 | 7.69 |
| 44488.979166666664 | 7.39 |
| 44488.989583333336 | 7.01 |
| 44489.0 | 7.14 |
| 44489.010416666664 | 6.83 |
| 44489.020833333336 | 6.52 |
| 44489.03125 | 6.15 |
| 44489.041666666664 | 5.69 |
| 44489.052083333336 | 5.41 |
| 44489.0625 | 5.33 |
| 44489.072916666664 | 5.11 |
| 44489.083333333336 | 5.37 |
| 44489.09375 | 5.86 |
| 44489.104166666664 | 5.68 |
| 44489.114583333336 | 8.88 |
| 44489.125 | 7.83 |
| 44489.135416666664 | 8.07 |
| 44489.145833333336 | 8.51 |
| 44489.15625 | 9.45 |
| 44489.166666666664 | 10.86 |
| 44489.177083333336 | 11.46 |
| 44489.1875 | 13.01 |
| 44489.197916666664 | 13.88 |
| 44489.208333333336 | 11.22 |
| 44489.21875 | 12.77 |
| 44489.229166666664 | 11.27 |
| 44489.239583333336 | 12.08 |
| 44489.25 | 11.74 |
| 44489.260416666664 | 11.59 |
| 44489.270833333336 | 10.65 |
| 44489.28125 | 12.08 |
| 44489.291666666664 | 10.79 |
| 44489.302083333336 | 9.76 |
| 44489.3125 | 10.38 |
| 44489.322916666664 | 10.58 |
| 44489.333333333336 | 10.08 |
| 44489.34375 | 10.04 |
| 44489.354166666664 | 9.57 |
| 44489.364583333336 | 10.86 |
| 44489.375 | 10.48 |
| 44489.385416666664 | 10.44 |
| 44489.395833333336 | 10.06 |
| 44489.40625 | 9.33 |
| 44489.416666666664 | 9.51 |
| 44489.427083333336 | 9.12 |
| 44489.4375 | 9.16 |
| 44489.447916666664 | 8.23 |
| 44489.458333333336 | 8.64 |
| 44489.46875 | 8.48 |
| 44489.479166666664 | 8.31 |
| 44489.489583333336 | 8.52 |
| 44489.5 | 7.56 |
| 44489.510416666664 | 7.88 |
| 44489.520833333336 | 7.04 |
| 44489.53125 | 6.87 |
| 44489.541666666664 | 7.1 |
| 44489.552083333336 | 7.02 |
| 44489.5625 | 6.46 |
| 44489.572916666664 | 5.89 |
| 44489.583333333336 | 7.31 |
| 44489.59375 | 6.03 |
| 44489.604166666664 | 5.78 |
| 44489.614583333336 | 6.38 |
| 44489.625 | 7.02 |
| 44489.635416666664 | 6.81 |
| 44489.645833333336 | 7.95 |
| 44489.65625 | 8.41 |
| 44489.666666666664 | 9.98 |
| 44489.677083333336 | 12.24 |
| 44489.6875 | 12.55 |
| 44489.697916666664 | 14.43 |
| 44489.708333333336 | 16.46 |
| 44489.71875 | 14.3 |
| 44489.729166666664 | 15.42 |
| 44489.739583333336 | 15.56 |
| 44489.75 | 15.35 |
| 44489.760416666664 | 14.27 |
| 44489.770833333336 | 14.87 |
| 44489.78125 | 13.33 |
| 44489.791666666664 | 17.07 |
| 44489.802083333336 | 10.92 |
| 44489.8125 | 11.35 |
| 44489.822916666664 | 11.8 |
| 44489.833333333336 | 12.59 |
| 44489.84375 | 12.5 |
| 44489.854166666664 | 12.07 |
| 44489.864583333336 | 12.04 |
| 44489.875 | 12.51 |
| 44489.885416666664 | 12.43 |
| 44489.895833333336 | 12.46 |
| 44489.90625 | 12.94 |
| 44489.916666666664 | 12.33 |
| 44489.927083333336 | 10.39 |
| 44489.9375 | 9.44 |
| 44489.947916666664 | 9.17 |
| 44489.958333333336 | 9.09 |
| 44489.96875 | 8.91 |
| 44489.979166666664 | 8.46 |
| 44489.989583333336 | 7.81 |
| 44490.0 | 7.72 |
| 44490.010416666664 | 6.81 |
| 44490.020833333336 | 6.92 |
| 44490.03125 | 6.65 |
| 44490.041666666664 | 6.59 |
| 44490.052083333336 | 6.07 |
| 44490.0625 | 5.67 |
| 44490.072916666664 | 6.35 |
| 44490.083333333336 | 6.75 |
| 44490.09375 | 4.97 |
| 44490.104166666664 | 4.57 |
| 44490.114583333336 | 4.91 |
| 44490.125 | 5.82 |
| 44490.135416666664 | 6.31 |
| 44490.145833333336 | 8.23 |
| 44490.15625 | 7.99 |
| 44490.166666666664 | 8.24 |
| 44490.177083333336 | 6.94 |
| 44490.1875 | 11.38 |
| 44490.197916666664 | 8.68 |
| 44490.208333333336 | 12.57 |
| 44490.21875 | 11.16 |
| 44490.229166666664 | 12.19 |
| 44490.239583333336 | 11.18 |
| 44490.25 | 10.15 |
| 44490.260416666664 | 10.63 |
| 44490.270833333336 | 10.39 |
| 44490.28125 | 10.44 |
| 44490.291666666664 | 9.82 |
| 44490.302083333336 | 9.69 |
| 44490.3125 | 8.15 |
| 44490.322916666664 | 9.63 |
| 44490.333333333336 | 9.1 |
| 44490.34375 | 9.47 |
| 44490.354166666664 | 9.29 |
| 44490.364583333336 | 9.62 |
| 44490.375 | 9.09 |
| 44490.385416666664 | 9.35 |
| 44490.395833333336 | 10.21 |
| 44490.40625 | 10.37 |
| 44490.416666666664 | 9.73 |
| 44490.427083333336 | 10.21 |
| 44490.4375 | 10.35 |
| 44490.447916666664 | 10.27 |
| 44490.458333333336 | 9.9 |
| 44490.46875 | 9.42 |
| 44490.479166666664 | 9.05 |
| 44490.489583333336 | 9.02 |
| 44490.5 | 8.63 |
| 44490.510416666664 | 8.37 |
| 44490.520833333336 | 7.99 |
| 44490.53125 | 7.84 |
| 44490.541666666664 | 7.81 |
| 44490.552083333336 | 7.05 |
| 44490.5625 | 8.02 |
| 44490.572916666664 | 6.63 |
| 44490.583333333336 | 6.62 |
| 44490.59375 | 6.73 |
| 44490.604166666664 | 5.57 |
| 44490.614583333336 | 5.42 |
| 44490.625 | 5.44 |
| 44490.635416666664 | 6.15 |
| 44490.645833333336 | 6.85 |
| 44490.65625 | 6.54 |
| 44490.666666666664 | 8.15 |
| 44490.677083333336 | 8.53 |
| 44490.6875 | 9.52 |
| 44490.697916666664 | 10.24 |
| 44490.708333333336 | 10.73 |
| 44490.71875 | 12.47 |
| 44490.729166666664 | 12.3 |
| 44490.739583333336 | 12.85 |
| 44490.75 | 12.97 |
| 44490.760416666664 | 12.5 |
| 44490.770833333336 | 13.01 |
| 44490.78125 | 12.49 |
| 44490.791666666664 | 12.16 |
| 44490.802083333336 | 11.7 |
| 44490.8125 | 11.26 |
| 44490.822916666664 | 10.67 |
| 44490.833333333336 | 10.73 |
| 44490.84375 | 9.91 |
| 44490.854166666664 | 9.78 |
| 44490.864583333336 | 10.57 |
| 44490.875 | 11.68 |
| 44490.885416666664 | 10.41 |
| 44490.895833333336 | 10.8 |
| 44490.90625 | 11.43 |
| 44490.916666666664 | 12.33 |
| 44490.927083333336 | 13.24 |
| 44490.9375 | 11.67 |
| 44490.947916666664 | 11.82 |
| 44490.958333333336 | 11.37 |
| 44490.96875 | 11.15 |
| 44490.979166666664 | 10.46 |
| 44490.989583333336 | 11.16 |
| 44491.0 | 9.13 |
| 44491.010416666664 | 8.24 |
| 44491.020833333336 | 7.67 |
| 44491.03125 | 6.63 |
| 44491.041666666664 | 6.85 |
| 44491.052083333336 | 6.57 |
| 44491.0625 | 5.96 |
| 44491.072916666664 | 5.54 |
| 44491.083333333336 | 5.44 |
| 44491.09375 | 5.56 |
| 44491.104166666664 | 5.6 |
| 44491.114583333336 | 5.5 |
| 44491.125 | 4.77 |
| 44491.135416666664 | 5.26 |
| 44491.145833333336 | 6.16 |
| 44491.15625 | 7.3 |
| 44491.166666666664 | 8.25 |
| 44491.177083333336 | 9.51 |
| 44491.1875 | 10.2 |
| 44491.197916666664 | 11.76 |
| 44491.208333333336 | 12.1 |
| 44491.21875 | 13.7 |
| 44491.229166666664 | 13.79 |
| 44491.239583333336 | 12.85 |
| 44491.25 | 12.64 |
| 44491.260416666664 | 13 |
| 44491.270833333336 | 11.47 |
| 44491.28125 | 11.81 |
| 44491.291666666664 | 11.72 |
| 44491.302083333336 | 12.61 |
| 44491.3125 | 12.83 |
| 44491.322916666664 | 11.74 |
| 44491.333333333336 | 10.18 |
| 44491.34375 | 9.89 |
| 44491.354166666664 | 9.98 |
| 44491.364583333336 | 9.6 |
| 44491.375 | 10.16 |
| 44491.385416666664 | 10.98 |
| 44491.395833333336 | 10.49 |
| 44491.40625 | 11.49 |
| 44491.416666666664 | 11.1 |
| 44491.427083333336 | 11.89 |
| 44491.4375 | 10.97 |
| 44491.447916666664 | 11.27 |
| 44491.458333333336 | 11.54 |
| 44491.46875 | 10.83 |
| 44491.479166666664 | 11.03 |
| 44491.489583333336 | 12.03 |
| 44491.5 | 11.51 |
| 44491.510416666664 | 10.93 |
| 44491.520833333336 | 10.56 |
| 44491.53125 | 9.73 |
| 44491.541666666664 | 9.49 |
| 44491.552083333336 | 8.75 |
| 44491.5625 | 8.57 |
| 44491.572916666664 | 7.94 |
| 44491.583333333336 | 7.08 |
| 44491.59375 | 6.85 |
| 44491.604166666664 | 6.4 |
| 44491.614583333336 | 6.16 |
| 44491.625 | 5.26 |
| 44491.635416666664 | 5.73 |
| 44491.645833333336 | 5.96 |
| 44491.65625 | 6.75 |
| 44491.666666666664 | 8.03 |
| 44491.677083333336 | 8.55 |
| 44491.6875 | 9.53 |
| 44491.697916666664 | 10.27 |
| 44491.708333333336 | 9.46 |
| 44491.71875 | 11.86 |
| 44491.729166666664 | 13.36 |
| 44491.739583333336 | 11.74 |
| 44491.75 | 12.95 |
| 44491.760416666664 | 14.27 |
| 44491.770833333336 | 14.91 |
| 44491.78125 | 12.97 |
| 44491.791666666664 | 14.35 |
| 44491.802083333336 | 12.79 |
| 44491.8125 | 12.69 |
| 44491.822916666664 | 14.01 |
| 44491.833333333336 | 12.28 |
| 44491.84375 | 11.54 |
| 44491.854166666664 | 10.87 |
| 44491.864583333336 | 9.55 |
| 44491.875 | 10.33 |
| 44491.885416666664 | 11.91 |
| 44491.895833333336 | 11.58 |
| 44491.90625 | 9.97 |
| 44491.916666666664 | 11.22 |
| 44491.927083333336 | 10.72 |
| 44491.9375 | 11.09 |
| 44491.947916666664 | 9.98 |
| 44491.958333333336 | 10.11 |
| 44491.96875 | 9.69 |
| 44491.979166666664 | 9.21 |
| 44491.989583333336 | 8.93 |
| 44492.0 | 8.43 |
| 44492.010416666664 | 7.97 |
| 44492.020833333336 | 8.33 |
| 44492.03125 | 7.33 |
| 44492.041666666664 | 7.22 |
| 44492.052083333336 | 7.5 |
| 44492.0625 | 7.37 |
| 44492.072916666664 | 7.18 |
| 44492.083333333336 | 7.01 |
| 44492.09375 | 7.01 |
| 44492.104166666664 | 6.48 |
| 44492.114583333336 | 6.08 |
| 44492.125 | 5.65 |
| 44492.135416666664 | 5.22 |
| 44492.145833333336 | 4.86 |
| 44492.15625 | 4.37 |
| 44492.166666666664 | 5.7 |
| 44492.177083333336 | 7.25 |
| 44492.1875 | 7.39 |
| 44492.197916666664 | 7.42 |
| 44492.208333333336 | 7.91 |
| 44492.21875 | 7.82 |
| 44492.229166666664 | 8.39 |
| 44492.239583333336 | 11.7 |
| 44492.25 | 12.1 |
| 44492.260416666664 | 12.32 |
| 44492.270833333336 | 11.17 |
| 44492.28125 | 12.32 |
| 44492.291666666664 | 10.86 |
| 44492.302083333336 | 10.59 |
| 44492.3125 | 9.85 |
| 44492.322916666664 | 8.99 |
| 44492.333333333336 | 8.95 |
| 44492.34375 | 8.89 |
| 44492.354166666664 | 7.89 |
| 44492.364583333336 | 7.72 |
| 44492.375 | 8.7 |
| 44492.385416666664 | 8.41 |
| 44492.395833333336 | 9.18 |
| 44492.40625 | 8.99 |
| 44492.416666666664 | 7.69 |
| 44492.427083333336 | 8.06 |
| 44492.4375 | 8.67 |
| 44492.447916666664 | 8.53 |
| 44492.458333333336 | 8.33 |
| 44492.46875 | 9.21 |
| 44492.479166666664 | 9.72 |
| 44492.489583333336 | 10.44 |
| 44492.5 | 10.1 |
| 44492.510416666664 | 9.65 |
| 44492.520833333336 | 9.59 |
| 44492.53125 | 9.14 |
| 44492.541666666664 | 8.69 |
| 44492.552083333336 | 8.22 |
| 44492.5625 | 7.97 |
| 44492.572916666664 | 7.83 |
| 44492.583333333336 | 7.33 |
| 44492.59375 | 6.86 |
| 44492.604166666664 | 6.77 |
| 44492.614583333336 | 5.98 |
| 44492.625 | 5.88 |
| 44492.635416666664 | 5.13 |
| 44492.645833333336 | 4.83 |
| 44492.65625 | 4.55 |
| 44492.666666666664 | 4.73 |
| 44492.677083333336 | 4.59 |
| 44492.6875 | 5.93 |
| 44492.697916666664 | 6.43 |
| 44492.708333333336 | 8.69 |
| 44492.71875 | 8.92 |
| 44492.729166666664 | 10.25 |
| 44492.739583333336 | 7.86 |
| 44492.75 | 11.77 |
| 44492.760416666664 | 12.76 |
| 44492.770833333336 | 13.21 |
| 44492.78125 | 13.48 |
| 44492.791666666664 | 13.54 |
| 44492.802083333336 | 14.42 |
| 44492.8125 | 15.27 |
| 44492.822916666664 | 15.39 |
| 44492.833333333336 | 14.65 |
| 44492.84375 | 14.36 |
| 44492.854166666664 | 12.92 |
| 44492.864583333336 | 11.78 |
| 44492.875 | 12.05 |
| 44492.885416666664 | 10.78 |
| 44492.895833333336 | 10.28 |
| 44492.90625 | 9.11 |
| 44492.916666666664 | 9.89 |
| 44492.927083333336 | 11.1 |
| 44492.9375 | 11.76 |
| 44492.947916666664 | 10.58 |
| 44492.958333333336 | 10.09 |
| 44492.96875 | 9.93 |
| 44492.979166666664 | 9.7 |
| 44492.989583333336 | 8.94 |
| 44493.0 | 8.81 |
| 44493.010416666664 | 8.66 |
| 44493.020833333336 | 7.74 |
| 44493.03125 | 8.13 |
| 44493.041666666664 | 7.56 |
| 44493.052083333336 | 7.47 |
| 44493.0625 | 7.15 |
| 44493.072916666664 | 6.94 |
| 44493.083333333336 | 7.15 |
| 44493.09375 | 6.25 |
| 44493.104166666664 | 7.2 |
| 44493.114583333336 | 6.4 |
| 44493.125 | 5.97 |
| 44493.135416666664 | 5.38 |
| 44493.145833333336 | 6.91 |
| 44493.15625 | 5.47 |
| 44493.166666666664 | 6.08 |
| 44493.177083333336 | 5.4 |
| 44493.1875 | 5.42 |
| 44493.197916666664 | 5.56 |
| 44493.208333333336 | 6.56 |
| 44493.21875 | 8 |
| 44493.229166666664 | 7.81 |
| 44493.239583333336 | 7.8 |
| 44493.25 | 11.29 |
| 44493.260416666664 | 11.14 |
| 44493.270833333336 | 13.36 |
| 44493.28125 | 9.95 |
| 44493.291666666664 | 12.08 |
| 44493.302083333336 | 12.06 |
| 44493.3125 | 11.44 |
| 44493.322916666664 | 10.83 |
| 44493.333333333336 | 11.33 |
| 44493.34375 | 10.52 |
| 44493.354166666664 | 9.71 |
| 44493.364583333336 | 9.28 |
| 44493.375 | 8.12 |
| 44493.385416666664 | 8.5 |
| 44493.395833333336 | 7.8 |
| 44493.40625 | 7.52 |
| 44493.416666666664 | 9.75 |
| 44493.427083333336 | 8.98 |
| 44493.4375 | 8.96 |
| 44493.447916666664 | 8.76 |
| 44493.458333333336 | 8.88 |
| 44493.46875 | 9.1 |
| 44493.479166666664 | 8.99 |
| 44493.489583333336 | 10.22 |
| 44493.5 | 9.74 |
| 44493.510416666664 | 10.13 |
| 44493.520833333336 | 10.7 |
| 44493.53125 | 10.29 |
| 44493.541666666664 | 9.29 |
| 44493.552083333336 | 9.36 |
| 44493.5625 | 8.93 |
| 44493.572916666664 | 8.42 |
| 44493.583333333336 | 7.87 |
| 44493.59375 | 7.95 |
| 44493.604166666664 | 6.87 |
| 44493.614583333336 | 6.22 |
| 44493.625 | 6.48 |
| 44493.635416666664 | 5.63 |
| 44493.645833333336 | 5.7 |
| 44493.65625 | 5.16 |
| 44493.666666666664 | 5.53 |
| 44493.677083333336 | 4.76 |
| 44493.6875 | 4.64 |
| 44493.697916666664 | 5.01 |
| 44493.708333333336 | 6.25 |
| 44493.71875 | 6.81 |
| 44493.729166666664 | 7.91 |
| 44493.739583333336 | 9.05 |
| 44493.75 | 9.34 |
| 44493.760416666664 | 10.35 |
| 44493.770833333336 | 10.63 |
| 44493.78125 | 10.64 |
| 44493.791666666664 | 12.14 |
| 44493.802083333336 | 12.13 |
| 44493.8125 | 12.46 |
| 44493.822916666664 | 12.86 |
| 44493.833333333336 | 12.53 |
| 44493.84375 | 12.89 |
| 44493.854166666664 | 13.2 |
| 44493.864583333336 | 12.62 |
| 44493.875 | 12.21 |
| 44493.885416666664 | 12.59 |
| 44493.895833333336 | 12.95 |
| 44493.90625 | 11.76 |
| 44493.916666666664 | 11.19 |
| 44493.927083333336 | 10.25 |
| 44493.9375 | 11.7 |
| 44493.947916666664 | 10.35 |
| 44493.958333333336 | 11.16 |
| 44493.96875 | 10.23 |
| 44493.979166666664 | 9.94 |
| 44493.989583333336 | 10.45 |
| 44494.0 | 10.69 |
| 44494.010416666664 | 9.33 |
| 44494.020833333336 | 8.81 |
| 44494.03125 | 9.54 |
| 44494.041666666664 | 9.06 |
| 44494.052083333336 | 9.18 |
| 44494.0625 | 8.58 |
| 44494.072916666664 | 8.03 |
| 44494.083333333336 | 8.54 |
| 44494.09375 | 7.77 |
| 44494.104166666664 | 8.23 |
| 44494.114583333336 | 7.63 |
| 44494.125 | 7.75 |
| 44494.135416666664 | 7.36 |
| 44494.145833333336 | 6.73 |
| 44494.15625 | 6.57 |
| 44494.166666666664 | 18.78 |
| 44494.177083333336 | 7.3 |
| 44494.1875 | 5.83 |
| 44494.197916666664 | 6.21 |
| 44494.208333333336 | 6.06 |
| 44494.21875 | 6.8 |
| 44494.229166666664 | 7.33 |
| 44494.239583333336 | 8.55 |
| 44494.25 | 8.63 |
| 44494.260416666664 | 9.82 |
| 44494.270833333336 | 11.12 |
| 44494.28125 | 12.34 |
| 44494.291666666664 | 12.54 |
| 44494.302083333336 | 12.08 |
| 44494.3125 | 10.79 |
| 44494.322916666664 | 11.04 |
| 44494.333333333336 | 10.7 |
| 44494.34375 | 10.35 |
| 44494.354166666664 | 9.41 |
| 44494.364583333336 | 9.15 |
| 44494.375 | 8.66 |
| 44494.385416666664 | 8.94 |
| 44494.395833333336 | 8.61 |
| 44494.40625 | 7.67 |
| 44494.416666666664 | 7.91 |
| 44494.427083333336 | 7.72 |
| 44494.4375 | 8.69 |
| 44494.447916666664 | 8.64 |
| 44494.458333333336 | 8.95 |
| 44494.46875 | 9.75 |
| 44494.479166666664 | 9.38 |
| 44494.489583333336 | 9.33 |
| 44494.5 | 9.53 |
| 44494.510416666664 | 10.18 |
| 44494.520833333336 | 10.41 |
| 44494.53125 | 10.32 |
| 44494.541666666664 | 10.57 |
| 44494.552083333336 | 10.42 |
| 44494.5625 | 10.04 |
| 44494.572916666664 | 9.98 |
| 44494.583333333336 | 9.64 |
| 44494.59375 | 10.11 |
| 44494.604166666664 | 7.81 |
| 44494.614583333336 | 9 |
| 44494.625 | 8.58 |
| 44494.635416666664 | 8.42 |
| 44494.645833333336 | 7.66 |
| 44494.65625 | 7.18 |
| 44494.666666666664 | 6.48 |
| 44494.677083333336 | 6.32 |
| 44494.6875 | 5.66 |
| 44494.697916666664 | 5.85 |
| 44494.708333333336 | 5.74 |
| 44494.71875 | 5.33 |
| 44494.729166666664 | 5.4 |
| 44494.739583333336 | 7.35 |
| 44494.75 | 9.58 |
| 44494.760416666664 | 9.8 |
| 44494.770833333336 | 10.26 |
| 44494.78125 | 10.46 |
| 44494.791666666664 | 10.86 |
| 44494.802083333336 | 11.25 |
| 44494.8125 | 11.43 |
| 44494.822916666664 | 12.19 |
| 44494.833333333336 | 13.79 |
| 44494.84375 | 14.22 |
| 44494.854166666664 | 13.33 |
| 44494.864583333336 | 14.49 |
| 44494.875 | 16.7 |
| 44494.885416666664 | 17.55 |
| 44494.895833333336 | 16.33 |
| 44494.90625 | 12.43 |
| 44494.916666666664 | 11.3 |
| 44494.927083333336 | 10.77 |
| 44494.9375 | 9.75 |
| 44494.947916666664 | 8.58 |
| 44494.958333333336 | 8.71 |
| 44494.96875 | 9 |
| 44494.979166666664 | 9.96 |
| 44494.989583333336 | 10.96 |
| 44495.0 | 10.28 |
| 44495.010416666664 | 10.38 |
| 44495.020833333336 | 9.84 |
| 44495.03125 | 9.87 |
| 44495.041666666664 | 10.09 |
| 44495.052083333336 | 10.94 |
| 44495.0625 | 10.16 |
| 44495.072916666664 | 9.54 |
| 44495.083333333336 | 9.26 |
| 44495.09375 | 9.42 |
| 44495.104166666664 | 8.9 |
| 44495.114583333336 | 8.71 |
| 44495.125 | 8.74 |
| 44495.135416666664 | 8.55 |
| 44495.145833333336 | 7.56 |
| 44495.15625 | 7.39 |
| 44495.166666666664 | 7.56 |
| 44495.177083333336 | 6.86 |
| 44495.1875 | 6.92 |
| 44495.197916666664 | 7.11 |
| 44495.208333333336 | 6.58 |
| 44495.21875 | 6.27 |
| 44495.229166666664 | 5.16 |
| 44495.239583333336 | 5.72 |
| 44495.25 | 7.06 |
| 44495.260416666664 | 8.46 |
| 44495.270833333336 | 10.39 |
| 44495.28125 | 12.63 |
| 44495.291666666664 | 11.09 |
| 44495.302083333336 | 12.53 |
| 44495.3125 | 11.19 |
| 44495.322916666664 | 10.73 |
| 44495.333333333336 | 10.01 |
| 44495.34375 | 10.26 |
| 44495.354166666664 | 10.81 |
| 44495.364583333336 | 10.48 |
| 44495.375 | 10.07 |
| 44495.385416666664 | 10.65 |
| 44495.395833333336 | 10.01 |
| 44495.40625 | 10.46 |
| 44495.416666666664 | 9.08 |
| 44495.427083333336 | 8.25 |
| 44495.4375 | 9.15 |
| 44495.447916666664 | 8.5 |
| 44495.458333333336 | 8.5 |
| 44495.46875 | 8.98 |
| 44495.479166666664 | 8.36 |
| 44495.489583333336 | 8.83 |
| 44495.5 | 10.87 |
| 44495.510416666664 | 9.49 |
| 44495.520833333336 | 10.12 |
| 44495.53125 | 10.07 |
| 44495.541666666664 | 9.48 |
| 44495.552083333336 | 10.71 |
| 44495.5625 | 10.39 |
| 44495.572916666664 | 10.39 |
| 44495.583333333336 | 10.29 |
| 44495.59375 | 11.35 |
| 44495.604166666664 | 10.32 |
| 44495.614583333336 | 10.4 |
| 44495.625 | 10.06 |
| 44495.635416666664 | 8.97 |
| 44495.645833333336 | 8.91 |
| 44495.65625 | 8.02 |
| 44495.666666666664 | 7.6 |
| 44495.677083333336 | 7.41 |
| 44495.6875 | 7.51 |
| 44495.697916666664 | 7.19 |
| 44495.708333333336 | 6.39 |
| 44495.71875 | 5.9 |
| 44495.729166666664 | 7.22 |
| 44495.739583333336 | 6.07 |
| 44495.75 | 6.98 |
| 44495.760416666664 | 6.86 |
| 44495.770833333336 | 6.39 |
| 44495.78125 | 6.22 |
| 44495.791666666664 | 8.53 |
| 44495.802083333336 | 8.33 |
| 44495.8125 | 7.89 |
| 44495.822916666664 | 9.14 |
| 44495.833333333336 | 9.13 |
| 44495.84375 | 9.92 |
| 44495.854166666664 | 10.53 |
| 44495.864583333336 | 11.4 |
| 44495.875 | 12.6 |
| 44495.885416666664 | 13.76 |
| 44495.895833333336 | 13.26 |
| 44495.90625 | 14.16 |
| 44495.916666666664 | 13.81 |
| 44495.927083333336 | 14.04 |
| 44495.9375 | 12.69 |
| 44495.947916666664 | 12.32 |
| 44495.958333333336 | 12.26 |
| 44495.96875 | 11.05 |
| 44495.979166666664 | 10.06 |
| 44495.989583333336 | 9.68 |
| 44496.0 | 10.36 |
| 44496.010416666664 | 10.59 |
| 44496.020833333336 | 9.8 |
| 44496.03125 | 9.72 |
| 44496.041666666664 | 10.88 |
| 44496.052083333336 | 10.31 |
| 44496.0625 | 9.93 |
| 44496.072916666664 | 9.89 |
| 44496.083333333336 | 11.13 |
| 44496.09375 | 11 |
| 44496.104166666664 | 12.62 |
| 44496.114583333336 | 12.82 |
| 44496.125 | 12.3 |
| 44496.135416666664 | 12.59 |
| 44496.145833333336 | 12.03 |
| 44496.15625 | 11.85 |
| 44496.166666666664 | 11.69 |
| 44496.177083333336 | 11.3 |
| 44496.1875 | 10.57 |
| 44496.197916666664 | 9.64 |
| 44496.208333333336 | 9.19 |
| 44496.21875 | 9.46 |
| 44496.229166666664 | 7.45 |
| 44496.239583333336 | 8.19 |
| 44496.25 | 7.58 |
| 44496.260416666664 | 7.34 |
| 44496.270833333336 | 6.41 |
| 44496.28125 | 6.45 |
| 44496.291666666664 | 6.6 |
| 44496.302083333336 | 6.94 |
| 44496.3125 | 6.42 |
| 44496.322916666664 | 6.76 |
| 44496.333333333336 | 6.71 |
| 44496.34375 | 6.99 |
| 44496.354166666664 | 7.09 |
| 44496.364583333336 | 7.58 |
| 44496.375 | 7.95 |
| 44496.385416666664 | 7.8 |
| 44496.395833333336 | 7.44 |
| 44496.40625 | 8.29 |
| 44496.416666666664 | 8.75 |
| 44496.427083333336 | 9.07 |
| 44496.4375 | 9.4 |
| 44496.447916666664 | 9.26 |
| 44496.458333333336 | 8.76 |
| 44496.46875 | 9.54 |
| 44496.479166666664 | 10.16 |
| 44496.489583333336 | 10.61 |
| 44496.5 | 11.01 |
| 44496.510416666664 | 9.56 |
| 44496.520833333336 | 10.39 |
| 44496.53125 | 10.99 |
| 44496.541666666664 | 9.94 |
| 44496.552083333336 | 9.26 |
| 44496.5625 | 9 |
| 44496.572916666664 | 9.12 |
| 44496.583333333336 | 8.68 |
| 44496.59375 | 8.39 |
| 44496.604166666664 | 8.22 |
| 44496.614583333336 | 7.9 |
| 44496.625 | 8.2 |
| 44496.635416666664 | 7.74 |
| 44496.645833333336 | 7.55 |
| 44496.65625 | 7.73 |
| 44496.666666666664 | 7.18 |
| 44496.677083333336 | 7.54 |
| 44496.6875 | 7.49 |
| 44496.697916666664 | 6.93 |
| 44496.708333333336 | 7.03 |
| 44496.71875 | 6.98 |
| 44496.729166666664 | 6.88 |
| 44496.739583333336 | 6.55 |
| 44496.75 | 6.1 |
| 44496.760416666664 | 5.91 |
| 44496.770833333336 | 5.08 |
| 44496.78125 | 5.24 |
| 44496.791666666664 | 4.61 |
| 44496.802083333336 | 4.83 |
| 44496.8125 | 4.94 |
| 44496.822916666664 | 5.16 |
| 44496.833333333336 | 5.15 |
| 44496.84375 | 4.7 |
| 44496.854166666664 | 5.42 |
| 44496.864583333336 | 4.77 |
| 44496.875 | 6.39 |
| 44496.885416666664 | 5.47 |
| 44496.895833333336 | 6.2 |
| 44496.90625 | 6.21 |
| 44496.916666666664 | 6.3 |
| 44496.927083333336 | 6.74 |
| 44496.9375 | 7.07 |
| 44496.947916666664 | 7.24 |
| 44496.958333333336 | 7.2 |
| 44496.96875 | 7.19 |
| 44496.979166666664 | 7.05 |
| 44496.989583333336 | 6.85 |
| 44497.0 | 6.78 |
| 44497.010416666664 | 5.84 |
| 44497.020833333336 | 6.61 |
| 44497.03125 | 6.83 |
| 44497.041666666664 | 6.05 |
| 44497.052083333336 | 5.9 |
| 44497.0625 | 7.06 |
| 44497.072916666664 | 6.79 |
| 44497.083333333336 | 6.45 |
| 44497.09375 | 6.11 |
| 44497.104166666664 | 6.04 |
| 44497.114583333336 | 5.85 |
| 44497.125 | 5.86 |
| 44497.135416666664 | 5.94 |
| 44497.145833333336 | 5.84 |
| 44497.15625 | 5.46 |
| 44497.166666666664 | 5.46 |
| 44497.177083333336 | 5.43 |
| 44497.1875 | 5.35 |
| 44497.197916666664 | 5.38 |
| 44497.208333333336 | 5.33 |
| 44497.21875 | 5.09 |
| 44497.229166666664 | 5.78 |
| 44497.239583333336 | 5.27 |
| 44497.25 | 5.33 |
| 44497.260416666664 | 5.07 |
| 44497.270833333336 | 5.51 |
| 44497.28125 | 5.4 |
| 44497.291666666664 | 5.51 |
| 44497.302083333336 | 5.44 |
| 44497.3125 | 6.28 |
| 44497.322916666664 | 6.05 |
| 44497.333333333336 | 6.38 |
| 44497.34375 | 5.14 |
| 44497.354166666664 | 5.66 |
| 44497.364583333336 | 5.48 |
| 44497.375 | 5.46 |
| 44497.385416666664 | 5.09 |
| 44497.395833333336 | 5.38 |
| 44497.40625 | 5.48 |
| 44497.416666666664 | 5.21 |
| 44497.427083333336 | 5.42 |
| 44497.4375 | 5.79 |
| 44497.447916666664 | 5.93 |
| 44497.458333333336 | 5.65 |
| 44497.46875 | 5.89 |
| 44497.479166666664 | 5.84 |
| 44497.489583333336 | 6.22 |
| 44497.5 | 6.32 |
| 44497.510416666664 | 6.64 |
| 44497.520833333336 | 5.84 |
| 44497.53125 | 6.24 |
| 44497.541666666664 | 7.72 |
| 44497.552083333336 | 6.5 |
| 44497.5625 | 6.77 |
| 44497.572916666664 | 6.72 |
| 44497.583333333336 | 7.06 |
| 44497.59375 | 6.32 |
| 44497.604166666664 | 6.08 |
| 44497.614583333336 | 6.89 |
| 44497.625 | 6.27 |
| 44497.635416666664 | 5.93 |
| 44497.645833333336 | 6.06 |
| 44497.65625 | 5.95 |
| 44497.666666666664 | 5.58 |
| 44497.677083333336 | 5.59 |
| 44497.6875 | 5.61 |
| 44497.697916666664 | 5.54 |
| 44497.708333333336 | 5.73 |
| 44497.71875 | 5.62 |
| 44497.729166666664 | 5.54 |
| 44497.739583333336 | 5.71 |
| 44497.75 | 5.36 |
| 44497.760416666664 | 5.13 |
| 44497.770833333336 | 4.9 |
| 44497.78125 | 4.95 |
| 44497.791666666664 | 4.41 |
| 44497.802083333336 | 4.57 |
| 44497.8125 | 4.59 |
| 44497.822916666664 | 3.9 |
| 44497.833333333336 | 4.31 |
| 44497.84375 | 4.36 |
| 44497.854166666664 | 4.55 |
| 44497.864583333336 | 5.23 |
| 44497.875 | 5.27 |
| 44497.885416666664 | 5.54 |
| 44497.895833333336 | 5.92 |
| 44497.90625 | 5.93 |
| 44497.916666666664 | 5.99 |
| 44497.927083333336 | 6.19 |
| 44497.9375 | 6.35 |
| 44497.947916666664 | 6.67 |
| 44497.958333333336 | 6.7 |
| 44497.96875 | 6.82 |
| 44497.979166666664 | 6.55 |
| 44497.989583333336 | 6.86 |
| 44498.0 | 6.88 |
| 44498.010416666664 | 6.76 |
| 44498.020833333336 | 6.67 |
| 44498.03125 | 6.82 |
| 44498.041666666664 | 7.4 |
| 44498.052083333336 | 6.91 |
| 44498.0625 | 7 |
| 44498.072916666664 | 7.27 |
| 44498.083333333336 | 7.14 |
| 44498.09375 | 6.86 |
| 44498.104166666664 | 7.24 |
| 44498.114583333336 | 7.12 |
| 44498.125 | 7.72 |
| 44498.135416666664 | 6.45 |
| 44498.145833333336 | 6.38 |
| 44498.15625 | 6.09 |
| 44498.166666666664 | 6.3 |
| 44498.177083333336 | 5.76 |
| 44498.1875 | 5.76 |
| 44498.197916666664 | 6.32 |
| 44498.208333333336 | 5.58 |
| 44498.21875 | 5.55 |
| 44498.229166666664 | 5.56 |
| 44498.239583333336 | 5.39 |
| 44498.25 | 5.67 |
| 44498.260416666664 | 5.3 |
| 44498.270833333336 | 5.71 |
| 44498.28125 | 6.91 |
| 44498.291666666664 | 8.14 |
| 44498.302083333336 | 8.33 |
| 44498.3125 | 7.94 |
| 44498.322916666664 | 7.53 |
| 44498.333333333336 | 7 |
| 44498.34375 | 6.66 |
| 44498.354166666664 | 6.27 |
| 44498.364583333336 | 6.52 |
| 44498.375 | 6.14 |
| 44498.385416666664 | 7.42 |
| 44498.395833333336 | 7.26 |
| 44498.40625 | 6.72 |
| 44498.416666666664 | 6.7 |
| 44498.427083333336 | 7.54 |
| 44498.4375 | 7.66 |
| 44498.447916666664 | 7.87 |
| 44498.458333333336 | 7.83 |
| 44498.46875 | 7.92 |
| 44498.479166666664 | 7.32 |
| 44498.489583333336 | 7.1 |
| 44498.5 | 7.79 |
| 44498.510416666664 | 8.4 |
| 44498.520833333336 | 7.86 |
| 44498.53125 | 8.71 |
| 44498.541666666664 | 9.32 |
| 44498.552083333336 | 9.42 |
| 44498.5625 | 9.98 |
| 44498.572916666664 | 9.58 |
| 44498.583333333336 | 9.39 |
| 44498.59375 | 9.22 |
| 44498.604166666664 | 8.83 |
| 44498.614583333336 | 8.5 |
| 44498.625 | 8.37 |
| 44498.635416666664 | 8.17 |
| 44498.645833333336 | 8.41 |
| 44498.65625 | 8.37 |
| 44498.666666666664 | 8.56 |
| 44498.677083333336 | 9.18 |
| 44498.6875 | 9.48 |
| 44498.697916666664 | 9.49 |
| 44498.708333333336 | 9.94 |
| 44498.71875 | 10.84 |
| 44498.729166666664 | 11.87 |
| 44498.739583333336 | 13 |
| 44498.75 | 14.8 |
| 44498.760416666664 | 13.78 |
| 44498.770833333336 | 14.29 |
| 44498.78125 | 12.98 |
| 44498.791666666664 | 13.14 |
| 44498.802083333336 | 12.58 |
| 44498.8125 | 11.49 |
| 44498.822916666664 | 11.28 |
| 44498.833333333336 | 10.57 |
| 44498.84375 | 9.22 |
| 44498.854166666664 | 8.33 |
| 44498.864583333336 | 8.16 |
| 44498.875 | 8.06 |
| 44498.885416666664 | 7.5 |
| 44498.895833333336 | 7.26 |
| 44498.90625 | 7.86 |
| 44498.916666666664 | 7.88 |
| 44498.927083333336 | 8.01 |
| 44498.9375 | 8.96 |
| 44498.947916666664 | 9.92 |
| 44498.958333333336 | 9.64 |
| 44498.96875 | 9.64 |
| 44498.979166666664 | 9.12 |
| 44498.989583333336 | 8.48 |
| 44499.0 | 9.75 |
| 44499.010416666664 | 9.67 |
| 44499.020833333336 | 8.4 |
| 44499.03125 | 8.12 |
| 44499.041666666664 | 8.51 |
| 44499.052083333336 | 9.46 |
| 44499.0625 | 11.32 |
| 44499.072916666664 | 10.77 |
| 44499.083333333336 | 10.27 |
| 44499.09375 | 9.34 |
| 44499.104166666664 | 9.38 |
| 44499.114583333336 | 9.96 |
| 44499.125 | 9.09 |
| 44499.135416666664 | 9.41 |
| 44499.145833333336 | 9.78 |
| 44499.15625 | 9.69 |
| 44499.166666666664 | 9.84 |
| 44499.177083333336 | 10.54 |
| 44499.1875 | 11 |
| 44499.197916666664 | 12.73 |
| 44499.208333333336 | 12.8 |
| 44499.21875 | 13.25 |
| 44499.229166666664 | 12.74 |
| 44499.239583333336 | 11.59 |
| 44499.25 | 10.91 |
| 44499.260416666664 | 8.52 |
| 44499.270833333336 | 10.13 |
| 44499.28125 | 9.17 |
| 44499.291666666664 | 8.77 |
| 44499.302083333336 | 9.12 |
| 44499.3125 | 6.93 |
| 44499.322916666664 | 7.75 |
| 44499.333333333336 | 7.9 |
| 44499.34375 | 7.75 |
| 44499.354166666664 | 7.46 |
| 44499.364583333336 | 7.57 |
| 44499.375 | 7.47 |
| 44499.385416666664 | 8.35 |
| 44499.395833333336 | 7.55 |
| 44499.40625 | 7.77 |
| 44499.416666666664 | 7.62 |
| 44499.427083333336 | 7.34 |
| 44499.4375 | 7.23 |
| 44499.447916666664 | 7.03 |
| 44499.458333333336 | 7.37 |
| 44499.46875 | 7.95 |
| 44499.479166666664 | 8.47 |
| 44499.489583333336 | 9.16 |
| 44499.5 | 8.95 |
| 44499.510416666664 | 8.38 |
| 44499.520833333336 | 9.23 |
| 44499.53125 | 9.45 |
| 44499.541666666664 | 9.45 |
| 44499.552083333336 | 10.31 |
| 44499.5625 | 9.56 |
| 44499.572916666664 | 10.26 |
| 44499.583333333336 | 10.32 |
| 44499.59375 | 9.42 |
| 44499.604166666664 | 9.2 |
| 44499.614583333336 | 8.59 |
| 44499.625 | 9.59 |
| 44499.635416666664 | 9.26 |
| 44499.645833333336 | 9.24 |
| 44499.65625 | 8.67 |
| 44499.666666666664 | 9.51 |
| 44499.677083333336 | 8.53 |
| 44499.6875 | 9.53 |
| 44499.697916666664 | 8.91 |
| 44499.708333333336 | 8.86 |
| 44499.71875 | 8.78 |
| 44499.729166666664 | 8.55 |
| 44499.739583333336 | 8.54 |
| 44499.75 | 8.01 |
| 44499.760416666664 | 7.99 |
| 44499.770833333336 | 8.11 |
| 44499.78125 | 7.59 |
| 44499.791666666664 | 7.97 |
| 44499.802083333336 | 7.72 |
| 44499.8125 | 6.99 |
| 44499.822916666664 | 7.86 |
| 44499.833333333336 | 7.07 |
| 44499.84375 | 6.93 |
| 44499.854166666664 | 6.67 |
| 44499.864583333336 | 6.34 |
| 44499.875 | 6.47 |
| 44499.885416666664 | 5.95 |
| 44499.895833333336 | 5.82 |
| 44499.90625 | 5.52 |
| 44499.916666666664 | 5.56 |
| 44499.927083333336 | 6.09 |
| 44499.9375 | 5.8 |
| 44499.947916666664 | 5.69 |
| 44499.958333333336 | 5.79 |
| 44499.96875 | 5.61 |
| 44499.979166666664 | 6.63 |
| 44499.989583333336 | 6.11 |
| 44500.0 | 5.81 |
| 44500.010416666664 | 6.81 |
| 44500.020833333336 | 7.32 |
| 44500.03125 | 7.42 |
| 44500.041666666664 | 7.76 |
| 44500.052083333336 | 8.87 |
| 44500.0625 | 9.07 |
| 44500.072916666664 | 9.79 |
| 44500.083333333336 | 9.47 |
| 44500.09375 | 9.09 |
| 44500.104166666664 | 8.96 |
| 44500.114583333336 | 9.19 |
| 44500.125 | 9.2 |
| 44500.135416666664 | 8.9 |
| 44500.145833333336 | 8.47 |
| 44500.15625 | 8.67 |
| 44500.166666666664 | 8.01 |
| 44500.177083333336 | 7.85 |
| 44500.1875 | 8.37 |
| 44500.197916666664 | 8.31 |
| 44500.208333333336 | 7.84 |
| 44500.21875 | 7.71 |
| 44500.229166666664 | 7.84 |
| 44500.239583333336 | 7.46 |
| 44500.25 | 7.64 |
| 44500.260416666664 | 6.77 |
| 44500.270833333336 | 6.87 |
| 44500.28125 | 6.94 |
| 44500.291666666664 | 6.47 |
| 44500.302083333336 | 6.54 |
| 44500.3125 | 6.36 |
| 44500.322916666664 | 5.82 |
| 44500.333333333336 | 6.34 |
| 44500.34375 | 5.89 |
| 44500.354166666664 | 5.73 |
| 44500.364583333336 | 5.94 |
| 44500.375 | 5.58 |
| 44500.385416666664 | 5.28 |
| 44500.395833333336 | 5.41 |
| 44500.40625 | 4.77 |
| 44500.416666666664 | 5.74 |
| 44500.427083333336 | 5.41 |
| 44500.4375 | 5.06 |
| 44500.447916666664 | 5.16 |
| 44500.458333333336 | 5.23 |
| 44500.46875 | 5.24 |
| 44500.479166666664 | 5.93 |
| 44500.489583333336 | 5.74 |
| 44500.5 | 6.5 |
| 44500.510416666664 | 7.36 |
| 44500.520833333336 | 6.38 |
| 44500.53125 | 8.08 |
| 44500.541666666664 | 7.37 |
| 44500.552083333336 | 8.46 |
| 44500.5625 | 8.42 |
| 44500.572916666664 | 9.2 |
| 44500.583333333336 | 9.41 |
| 44500.59375 | 9.78 |
| 44500.604166666664 | 10.2 |
| 44500.614583333336 | 9.25 |
| 44500.625 | 10.13 |
| 44500.635416666664 | 9.89 |
| 44500.645833333336 | 9.65 |
| 44500.65625 | 8.83 |
| 44500.666666666664 | 8.71 |
| 44500.677083333336 | 9.3 |
| 44500.6875 | 8.72 |
| 44500.697916666664 | 8.6 |
| 44500.708333333336 | 8.89 |
| 44500.71875 | 8.2 |
| 44500.729166666664 | 7.86 |
| 44500.739583333336 | 8.28 |
| 44500.75 | 7.85 |
| 44500.760416666664 | 7.49 |
| 44500.770833333336 | 7.55 |
| 44500.78125 | 7.75 |
| 44500.791666666664 | 7.35 |
| 44500.802083333336 | 7.46 |
| 44500.8125 | 6.8 |
| 44500.822916666664 | 7 |
| 44500.833333333336 | 6.84 |
| 44500.84375 | 6.11 |
| 44500.854166666664 | 6.08 |
| 44500.864583333336 | 5.95 |
| 44500.875 | 5.69 |
| 44500.885416666664 | 6.01 |
| 44500.895833333336 | 5.77 |
| 44500.90625 | 5.58 |
| 44500.916666666664 | 5.22 |
| 44500.927083333336 | 5.59 |
| 44500.9375 | 5.97 |
| 44500.947916666664 | 5.64 |
| 44500.958333333336 | 5.15 |
| 44500.96875 | 5.42 |
| 44500.979166666664 | 5.92 |
| 44500.989583333336 | 27.41 |
| 44501.0 | 6.95 |
| 44501.010416666664 | 7.44 |
| 44501.020833333336 | 7.81 |
| 44501.03125 | 8.39 |
| 44501.041666666664 | 9.21 |
| 44501.052083333336 | 10.07 |
| 44501.0625 | 10.7 |
| 44501.072916666664 | 9.64 |
| 44501.083333333336 | 10.57 |
| 44501.09375 | 11.32 |
| 44501.104166666664 | 11.58 |
| 44501.114583333336 | 14.35 |
| 44501.125 | 13.03 |
| 44501.135416666664 | 11.87 |
| 44501.145833333336 | 12.02 |
| 44501.15625 | 10.68 |